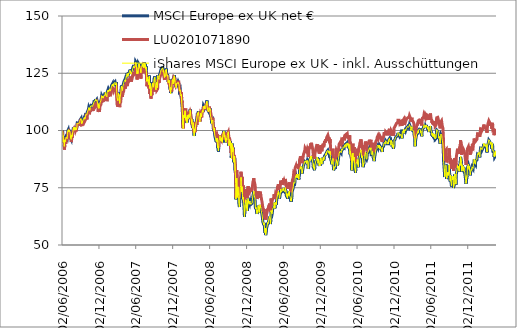
| Category | MSCI Europe ex UK net € | LU0201071890 | iShares MSCI Europe ex UK - inkl. Ausschüttungen |
|---|---|---|---|
| 02/06/2006 | 100 | 100 | 100 |
| 05/06/2006 | 99.412 | 100 | 99.411 |
| 06/06/2006 | 97.257 | 97.032 | 97.28 |
| 07/06/2006 | 97.73 | 96.475 | 97.733 |
| 08/06/2006 | 94.902 | 95.176 | 94.9 |
| 09/06/2006 | 96.413 | 95.176 | 96.423 |
| 12/06/2006 | 95.338 | 94.62 | 95.353 |
| 13/06/2006 | 93.068 | 92.208 | 93.094 |
| 14/06/2006 | 93.34 | 91.651 | 93.366 |
| 15/06/2006 | 95.714 | 93.692 | 95.713 |
| 16/06/2006 | 94.985 | 94.249 | 95.008 |
| 19/06/2006 | 95.79 | 94.991 | 95.854 |
| 20/06/2006 | 96.29 | 94.249 | 96.294 |
| 21/06/2006 | 96.523 | 94.62 | 96.536 |
| 22/06/2006 | 97.085 | 96.289 | 97.097 |
| 23/06/2006 | 97.28 | 95.918 | 97.291 |
| 26/06/2006 | 97.078 | 96.104 | 97.096 |
| 27/06/2006 | 96.367 | 96.289 | 96.387 |
| 28/06/2006 | 96.334 | 95.918 | 96.35 |
| 29/06/2006 | 98.132 | 96.846 | 98.143 |
| 30/06/2006 | 99.799 | 98.887 | 99.799 |
| 03/07/2006 | 100.395 | 99.258 | 100.377 |
| 04/07/2006 | 100.609 | 99.443 | 100.595 |
| 05/07/2006 | 99.355 | 98.887 | 99.334 |
| 06/07/2006 | 100.236 | 98.887 | 100.241 |
| 07/07/2006 | 99.886 | 99.258 | 99.877 |
| 10/07/2006 | 100.283 | 99.072 | 100.241 |
| 11/07/2006 | 99.255 | 98.887 | 99.233 |
| 12/07/2006 | 99.654 | 99.072 | 99.637 |
| 13/07/2006 | 98.024 | 97.217 | 98.008 |
| 14/07/2006 | 96.695 | 96.66 | 96.677 |
| 17/07/2006 | 96.121 | 94.991 | 96.103 |
| 18/07/2006 | 95.728 | 95.362 | 95.667 |
| 19/07/2006 | 98.02 | 95.547 | 97.97 |
| 20/07/2006 | 98.397 | 98.145 | 98.342 |
| 21/07/2006 | 97.405 | 96.846 | 97.369 |
| 24/07/2006 | 99.178 | 97.217 | 99.121 |
| 25/07/2006 | 99.263 | 98.701 | 99.24 |
| 26/07/2006 | 99.585 | 99.258 | 99.563 |
| 27/07/2006 | 100.687 | 100 | 100.642 |
| 28/07/2006 | 101.352 | 100.186 | 101.29 |
| 31/07/2006 | 101.094 | 100.742 | 101.013 |
| 01/08/2006 | 100.239 | 100.557 | 100.159 |
| 02/08/2006 | 101.308 | 100.371 | 101.215 |
| 03/08/2006 | 100.477 | 99.814 | 100.392 |
| 04/08/2006 | 101.553 | 101.113 | 101.468 |
| 07/08/2006 | 100.264 | 100 | 100.186 |
| 08/08/2006 | 100.424 | 99.814 | 100.317 |
| 09/08/2006 | 101.24 | 100.557 | 101.13 |
| 10/08/2006 | 100.366 | 99.629 | 100.269 |
| 11/08/2006 | 100.446 | 100.186 | 100.35 |
| 14/08/2006 | 101.387 | 100.557 | 101.287 |
| 15/08/2006 | 102.566 | 101.855 | 102.463 |
| 16/08/2006 | 103.279 | 102.597 | 103.19 |
| 17/08/2006 | 103.645 | 102.783 | 103.566 |
| 18/08/2006 | 103.442 | 102.968 | 103.353 |
| 21/08/2006 | 103.153 | 102.597 | 103.072 |
| 22/08/2006 | 103.535 | 102.226 | 103.453 |
| 23/08/2006 | 102.957 | 102.412 | 102.867 |
| 24/08/2006 | 103.38 | 102.968 | 103.298 |
| 25/08/2006 | 103.39 | 102.597 | 103.298 |
| 28/08/2006 | 103.922 | 102.597 | 103.297 |
| 29/08/2006 | 104.126 | 103.711 | 104.041 |
| 30/08/2006 | 104.593 | 103.896 | 104.517 |
| 31/08/2006 | 104.381 | 103.711 | 104.284 |
| 01/09/2006 | 104.733 | 104.267 | 104.643 |
| 04/09/2006 | 105.283 | 104.453 | 105.171 |
| 05/09/2006 | 104.923 | 103.896 | 104.816 |
| 06/09/2006 | 103.912 | 103.34 | 103.822 |
| 07/09/2006 | 103.056 | 102.412 | 102.955 |
| 08/09/2006 | 103.472 | 102.597 | 103.384 |
| 11/09/2006 | 103.033 | 102.226 | 102.915 |
| 12/09/2006 | 104.222 | 102.597 | 104.119 |
| 13/09/2006 | 104.64 | 103.525 | 104.535 |
| 14/09/2006 | 104.542 | 103.711 | 104.447 |
| 15/09/2006 | 104.926 | 103.896 | 104.834 |
| 18/09/2006 | 105.068 | 103.711 | 104.971 |
| 19/09/2006 | 104.507 | 103.896 | 104.419 |
| 20/09/2006 | 105.777 | 104.267 | 105.675 |
| 21/09/2006 | 106.015 | 104.824 | 105.942 |
| 22/09/2006 | 104.993 | 104.082 | 104.929 |
| 25/09/2006 | 104.894 | 104.267 | 104.815 |
| 26/09/2006 | 106.225 | 104.824 | 106.131 |
| 27/09/2006 | 107.01 | 105.195 | 106.918 |
| 28/09/2006 | 107.112 | 105.937 | 107.006 |
| 29/09/2006 | 107.163 | 106.122 | 107.059 |
| 02/10/2006 | 106.947 | 105.38 | 106.828 |
| 03/10/2006 | 106.574 | 104.824 | 106.445 |
| 04/10/2006 | 107.352 | 105.566 | 107.218 |
| 05/10/2006 | 108.148 | 106.679 | 108.032 |
| 06/10/2006 | 108.169 | 106.494 | 108.044 |
| 09/10/2006 | 108.348 | 106.679 | 108.228 |
| 10/10/2006 | 109.095 | 107.421 | 108.997 |
| 11/10/2006 | 109.251 | 107.236 | 109.147 |
| 12/10/2006 | 110.095 | 108.349 | 109.986 |
| 13/10/2006 | 110.059 | 108.534 | 109.948 |
| 16/10/2006 | 110.214 | 108.72 | 110.113 |
| 17/10/2006 | 108.931 | 107.978 | 108.824 |
| 18/10/2006 | 110.002 | 108.534 | 109.901 |
| 19/10/2006 | 110.02 | 108.349 | 109.937 |
| 20/10/2006 | 110.409 | 108.534 | 110.312 |
| 23/10/2006 | 110.924 | 108.72 | 110.817 |
| 24/10/2006 | 110.817 | 109.276 | 110.716 |
| 25/10/2006 | 111.1 | 109.462 | 111.006 |
| 26/10/2006 | 111.189 | 109.833 | 111.092 |
| 27/10/2006 | 110.99 | 109.276 | 110.897 |
| 30/10/2006 | 110.563 | 108.534 | 110.483 |
| 31/10/2006 | 110.517 | 109.091 | 110.433 |
| 01/11/2006 | 110.963 | 109.647 | 110.882 |
| 02/11/2006 | 110.289 | 108.534 | 110.19 |
| 03/11/2006 | 110.801 | 109.276 | 110.696 |
| 06/11/2006 | 112.119 | 109.833 | 112.031 |
| 07/11/2006 | 112.706 | 110.761 | 112.602 |
| 08/11/2006 | 112.616 | 110.39 | 112.515 |
| 09/11/2006 | 112.674 | 110.946 | 112.578 |
| 10/11/2006 | 112.563 | 110.761 | 112.462 |
| 13/11/2006 | 113.021 | 111.317 | 112.933 |
| 14/11/2006 | 112.923 | 111.503 | 112.818 |
| 15/11/2006 | 113.683 | 111.688 | 113.568 |
| 16/11/2006 | 113.759 | 112.059 | 113.65 |
| 17/11/2006 | 112.962 | 111.317 | 112.848 |
| 20/11/2006 | 113.299 | 111.132 | 113.181 |
| 21/11/2006 | 113.515 | 112.059 | 113.398 |
| 22/11/2006 | 113.755 | 112.245 | 113.644 |
| 23/11/2006 | 113.548 | 111.874 | 113.441 |
| 24/11/2006 | 112.593 | 110.39 | 112.484 |
| 27/11/2006 | 110.677 | 109.833 | 110.568 |
| 28/11/2006 | 110.186 | 108.163 | 110.072 |
| 29/11/2006 | 111.752 | 109.647 | 111.652 |
| 30/11/2006 | 110.847 | 109.833 | 110.747 |
| 01/12/2006 | 109.749 | 109.647 | 109.654 |
| 04/12/2006 | 110.593 | 108.163 | 110.495 |
| 05/12/2006 | 111.524 | 109.462 | 111.427 |
| 06/12/2006 | 111.613 | 109.833 | 111.521 |
| 07/12/2006 | 112.273 | 110.761 | 112.185 |
| 08/12/2006 | 112.217 | 110.575 | 112.124 |
| 11/12/2006 | 113.033 | 111.317 | 112.944 |
| 12/12/2006 | 113.438 | 111.503 | 113.354 |
| 13/12/2006 | 114.062 | 112.43 | 113.983 |
| 14/12/2006 | 114.692 | 112.616 | 114.603 |
| 15/12/2006 | 115.29 | 113.544 | 115.216 |
| 18/12/2006 | 115.383 | 113.915 | 115.297 |
| 19/12/2006 | 114.551 | 112.801 | 114.449 |
| 20/12/2006 | 115.07 | 113.173 | 114.975 |
| 21/12/2006 | 115.031 | 113.173 | 114.936 |
| 22/12/2006 | 114.214 | 112.987 | 114.121 |
| 25/12/2006 | 114.214 | 112.987 | 114.121 |
| 26/12/2006 | 114.199 | 112.987 | 114.121 |
| 27/12/2006 | 115.486 | 112.987 | 115.379 |
| 28/12/2006 | 115.485 | 113.544 | 115.388 |
| 29/12/2006 | 115.401 | 113.544 | 115.311 |
| 01/01/2007 | 115.401 | 113.544 | 115.313 |
| 02/01/2007 | 116.719 | 114.657 | 116.631 |
| 03/01/2007 | 116.91 | 114.842 | 116.811 |
| 04/01/2007 | 116.436 | 114.286 | 116.321 |
| 05/01/2007 | 115.622 | 114.286 | 115.503 |
| 08/01/2007 | 115.527 | 113.915 | 115.397 |
| 09/01/2007 | 115.679 | 114.1 | 115.543 |
| 10/01/2007 | 114.837 | 112.801 | 114.696 |
| 11/01/2007 | 116.733 | 113.358 | 116.591 |
| 12/01/2007 | 117.101 | 114.842 | 116.945 |
| 15/01/2007 | 117.789 | 115.584 | 117.616 |
| 16/01/2007 | 117.379 | 115.584 | 117.196 |
| 17/01/2007 | 117.133 | 114.657 | 116.934 |
| 18/01/2007 | 116.976 | 115.77 | 116.765 |
| 19/01/2007 | 117.873 | 115.028 | 117.681 |
| 22/01/2007 | 117.352 | 116.327 | 117.183 |
| 23/01/2007 | 117.285 | 115.028 | 117.111 |
| 24/01/2007 | 118.401 | 116.141 | 118.217 |
| 25/01/2007 | 118.156 | 116.512 | 117.955 |
| 26/01/2007 | 117.401 | 115.955 | 117.202 |
| 29/01/2007 | 117.931 | 115.77 | 117.728 |
| 30/01/2007 | 118.518 | 116.141 | 118.326 |
| 31/01/2007 | 118.255 | 116.327 | 118.082 |
| 01/02/2007 | 119.216 | 117.44 | 119.055 |
| 02/02/2007 | 119.683 | 117.625 | 119.498 |
| 05/02/2007 | 119.762 | 117.625 | 119.576 |
| 06/02/2007 | 119.937 | 118.182 | 119.743 |
| 07/02/2007 | 120.496 | 118.182 | 120.319 |
| 08/02/2007 | 119.616 | 117.254 | 119.433 |
| 09/02/2007 | 120.272 | 117.996 | 120.094 |
| 12/02/2007 | 119.393 | 117.254 | 119.209 |
| 13/02/2007 | 119.806 | 117.069 | 119.585 |
| 14/02/2007 | 120.821 | 117.625 | 120.613 |
| 15/02/2007 | 120.822 | 118.182 | 120.598 |
| 16/02/2007 | 120.744 | 118.182 | 120.518 |
| 19/02/2007 | 121.293 | 118.553 | 121.066 |
| 20/02/2007 | 120.81 | 117.996 | 120.556 |
| 21/02/2007 | 120.118 | 117.625 | 119.867 |
| 22/02/2007 | 120.438 | 118.182 | 120.185 |
| 23/02/2007 | 120.636 | 118.182 | 120.389 |
| 26/02/2007 | 121.134 | 118.738 | 120.873 |
| 27/02/2007 | 117.404 | 115.399 | 117.15 |
| 28/02/2007 | 115.781 | 113.544 | 115.537 |
| 01/03/2007 | 114.611 | 111.503 | 114.375 |
| 02/03/2007 | 114.491 | 111.503 | 114.267 |
| 05/03/2007 | 113.267 | 110.39 | 113.036 |
| 06/03/2007 | 114.131 | 111.503 | 113.901 |
| 07/03/2007 | 114.911 | 112.245 | 114.663 |
| 08/03/2007 | 116.483 | 113.544 | 116.248 |
| 09/03/2007 | 116.616 | 114.1 | 116.373 |
| 12/03/2007 | 116.246 | 113.358 | 116.003 |
| 13/03/2007 | 115.057 | 112.801 | 114.8 |
| 14/03/2007 | 112.085 | 110.204 | 111.842 |
| 15/03/2007 | 114.232 | 110.761 | 113.99 |
| 16/03/2007 | 114.311 | 111.688 | 114.064 |
| 19/03/2007 | 116.107 | 112.43 | 115.866 |
| 20/03/2007 | 116.747 | 112.616 | 116.511 |
| 21/03/2007 | 117.11 | 114.1 | 116.87 |
| 22/03/2007 | 119.094 | 115.77 | 118.85 |
| 23/03/2007 | 119.648 | 116.512 | 119.391 |
| 26/03/2007 | 118.558 | 116.698 | 118.296 |
| 27/03/2007 | 118.52 | 115.77 | 118.264 |
| 28/03/2007 | 117.76 | 114.657 | 117.506 |
| 29/03/2007 | 119.168 | 115.955 | 118.905 |
| 30/03/2007 | 119.238 | 116.327 | 118.928 |
| 02/04/2007 | 119.55 | 116.327 | 119.285 |
| 03/04/2007 | 120.906 | 117.254 | 120.632 |
| 04/04/2007 | 121.221 | 117.996 | 120.934 |
| 05/04/2007 | 121.533 | 118.553 | 121.254 |
| 06/04/2007 | 121.533 | 118.553 | 121.254 |
| 09/04/2007 | 121.449 | 118.553 | 121.254 |
| 10/04/2007 | 122.424 | 119.109 | 122.133 |
| 11/04/2007 | 122.124 | 120.037 | 121.832 |
| 12/04/2007 | 121.718 | 118.367 | 121.411 |
| 13/04/2007 | 122.542 | 119.481 | 122.214 |
| 16/04/2007 | 124.083 | 120.779 | 123.757 |
| 17/04/2007 | 124.02 | 121.336 | 123.711 |
| 18/04/2007 | 123.588 | 120.223 | 123.283 |
| 19/04/2007 | 123.261 | 119.481 | 122.952 |
| 20/04/2007 | 125.084 | 122.078 | 124.769 |
| 23/04/2007 | 124.992 | 121.892 | 124.681 |
| 24/04/2007 | 124.009 | 121.336 | 123.698 |
| 25/04/2007 | 124.997 | 122.078 | 124.687 |
| 26/04/2007 | 125.467 | 122.635 | 125.161 |
| 27/04/2007 | 124.792 | 121.336 | 124.486 |
| 30/04/2007 | 124.998 | 121.707 | 124.691 |
| 01/05/2007 | 124.966 | 121.707 | 124.665 |
| 02/05/2007 | 125.621 | 121.892 | 125.294 |
| 03/05/2007 | 125.657 | 122.449 | 125.339 |
| 04/05/2007 | 126.602 | 123.006 | 126.258 |
| 07/05/2007 | 126.765 | 123.562 | 126.437 |
| 08/05/2007 | 125.49 | 122.449 | 125.147 |
| 09/05/2007 | 125.782 | 122.263 | 125.451 |
| 10/05/2007 | 124.941 | 122.449 | 124.599 |
| 11/05/2007 | 125.655 | 121.336 | 125.305 |
| 14/05/2007 | 125.523 | 122.82 | 125.192 |
| 15/05/2007 | 126.16 | 122.635 | 125.806 |
| 16/05/2007 | 125.865 | 123.377 | 125.557 |
| 17/05/2007 | 126.093 | 123.377 | 125.789 |
| 18/05/2007 | 127.381 | 124.49 | 127.049 |
| 21/05/2007 | 127.408 | 125.046 | 127.017 |
| 22/05/2007 | 127.552 | 125.046 | 127.212 |
| 23/05/2007 | 128.558 | 125.603 | 128.207 |
| 24/05/2007 | 127.606 | 125.232 | 127.274 |
| 25/05/2007 | 127.726 | 124.675 | 127.374 |
| 28/05/2007 | 128.003 | 124.675 | 127.639 |
| 29/05/2007 | 128.034 | 125.232 | 127.68 |
| 30/05/2007 | 127.735 | 124.119 | 127.389 |
| 31/05/2007 | 129.046 | 126.531 | 128.683 |
| 01/06/2007 | 130.112 | 127.458 | 129.753 |
| 04/06/2007 | 129.657 | 127.087 | 129.288 |
| 05/06/2007 | 128.93 | 126.716 | 128.57 |
| 06/06/2007 | 126.83 | 125.603 | 126.469 |
| 07/06/2007 | 125.129 | 123.191 | 124.791 |
| 08/06/2007 | 124.947 | 122.263 | 124.612 |
| 11/06/2007 | 126.07 | 123.562 | 125.733 |
| 12/06/2007 | 125.159 | 123.191 | 124.842 |
| 13/06/2007 | 125.454 | 123.191 | 125.121 |
| 14/06/2007 | 127.646 | 124.861 | 127.306 |
| 15/06/2007 | 129.291 | 127.458 | 128.933 |
| 18/06/2007 | 128.954 | 127.644 | 128.622 |
| 19/06/2007 | 128.649 | 126.716 | 128.317 |
| 20/06/2007 | 129.259 | 128.2 | 128.926 |
| 21/06/2007 | 127.754 | 125.974 | 127.436 |
| 22/06/2007 | 127.407 | 125.603 | 127.088 |
| 25/06/2007 | 127.088 | 124.304 | 126.769 |
| 26/06/2007 | 126.125 | 124.304 | 125.821 |
| 27/06/2007 | 125.505 | 122.635 | 125.204 |
| 28/06/2007 | 126.955 | 124.304 | 126.642 |
| 29/06/2007 | 127.724 | 124.861 | 127.393 |
| 02/07/2007 | 127.541 | 125.417 | 127.222 |
| 03/07/2007 | 128.586 | 126.716 | 128.259 |
| 04/07/2007 | 129.195 | 127.087 | 128.857 |
| 05/07/2007 | 128.394 | 126.902 | 128.057 |
| 06/07/2007 | 129.12 | 126.902 | 128.763 |
| 09/07/2007 | 129.511 | 127.644 | 129.15 |
| 10/07/2007 | 128.264 | 126.345 | 127.92 |
| 11/07/2007 | 127.716 | 125.046 | 127.381 |
| 12/07/2007 | 129.323 | 126.345 | 128.979 |
| 13/07/2007 | 129.805 | 128.015 | 129.461 |
| 16/07/2007 | 130.144 | 128.015 | 129.793 |
| 17/07/2007 | 129.401 | 127.458 | 129.05 |
| 18/07/2007 | 127.886 | 126.531 | 127.536 |
| 19/07/2007 | 129.155 | 127.273 | 128.813 |
| 20/07/2007 | 127.412 | 126.16 | 127.079 |
| 23/07/2007 | 128.085 | 125.232 | 127.765 |
| 24/07/2007 | 126.29 | 124.49 | 125.987 |
| 25/07/2007 | 124.925 | 123.748 | 124.645 |
| 26/07/2007 | 121.732 | 120.408 | 121.482 |
| 27/07/2007 | 121.357 | 119.295 | 121.113 |
| 30/07/2007 | 121.394 | 119.481 | 121.155 |
| 31/07/2007 | 123.567 | 121.15 | 123.297 |
| 01/08/2007 | 121.831 | 120.408 | 121.563 |
| 02/08/2007 | 122.57 | 120.779 | 122.288 |
| 03/08/2007 | 121.127 | 119.852 | 120.849 |
| 06/08/2007 | 120.203 | 118.367 | 119.94 |
| 07/08/2007 | 121.614 | 118.553 | 121.354 |
| 08/08/2007 | 124.039 | 120.408 | 123.761 |
| 09/08/2007 | 121.77 | 118.553 | 121.526 |
| 10/08/2007 | 118.569 | 115.955 | 118.354 |
| 13/08/2007 | 120.793 | 117.996 | 120.541 |
| 14/08/2007 | 119.489 | 118.182 | 119.236 |
| 15/08/2007 | 119.221 | 115.955 | 118.963 |
| 16/08/2007 | 115.395 | 113.915 | 115.167 |
| 17/08/2007 | 117.532 | 115.399 | 117.285 |
| 20/08/2007 | 118.37 | 115.955 | 118.111 |
| 21/08/2007 | 118.477 | 115.399 | 118.22 |
| 22/08/2007 | 120.286 | 117.44 | 119.987 |
| 23/08/2007 | 120.413 | 118.367 | 120.115 |
| 24/08/2007 | 120.99 | 117.996 | 120.684 |
| 27/08/2007 | 121.152 | 119.109 | 120.839 |
| 28/08/2007 | 119.218 | 117.811 | 118.934 |
| 29/08/2007 | 119.87 | 117.069 | 119.575 |
| 30/08/2007 | 121.102 | 117.625 | 120.795 |
| 31/08/2007 | 122.547 | 120.223 | 122.235 |
| 03/09/2007 | 122.812 | 120.408 | 122.498 |
| 04/09/2007 | 123.598 | 120.408 | 123.293 |
| 05/09/2007 | 121.345 | 120.037 | 121.038 |
| 06/09/2007 | 121.687 | 119.295 | 121.371 |
| 07/09/2007 | 119.093 | 117.811 | 118.761 |
| 10/09/2007 | 118.087 | 117.069 | 117.759 |
| 11/09/2007 | 119.852 | 116.883 | 119.536 |
| 12/09/2007 | 120.215 | 117.069 | 119.908 |
| 13/09/2007 | 121.314 | 118.738 | 120.993 |
| 14/09/2007 | 120.325 | 117.625 | 120.016 |
| 17/09/2007 | 119.018 | 117.254 | 118.73 |
| 18/09/2007 | 120.855 | 118.182 | 120.555 |
| 19/09/2007 | 124.249 | 121.892 | 123.954 |
| 20/09/2007 | 123.485 | 121.521 | 123.183 |
| 21/09/2007 | 123.91 | 122.078 | 123.619 |
| 24/09/2007 | 123.685 | 122.078 | 123.376 |
| 25/09/2007 | 122.609 | 120.779 | 122.296 |
| 26/09/2007 | 123.513 | 121.892 | 123.2 |
| 27/09/2007 | 124.252 | 122.449 | 123.945 |
| 28/09/2007 | 124.246 | 122.449 | 123.927 |
| 01/10/2007 | 125.249 | 122.263 | 124.915 |
| 02/10/2007 | 125.742 | 124.119 | 125.386 |
| 03/10/2007 | 125.852 | 123.748 | 125.482 |
| 04/10/2007 | 125.786 | 123.933 | 125.451 |
| 05/10/2007 | 126.778 | 124.675 | 126.44 |
| 08/10/2007 | 126.529 | 124.675 | 126.166 |
| 09/10/2007 | 127.07 | 125.046 | 126.699 |
| 10/10/2007 | 127.134 | 125.417 | 126.802 |
| 11/10/2007 | 127.954 | 126.531 | 127.598 |
| 12/10/2007 | 127.874 | 125.788 | 127.543 |
| 15/10/2007 | 126.918 | 126.345 | 126.59 |
| 16/10/2007 | 125.856 | 124.304 | 125.523 |
| 17/10/2007 | 126.472 | 125.232 | 126.138 |
| 18/10/2007 | 125.703 | 124.119 | 125.372 |
| 19/10/2007 | 125.12 | 124.49 | 124.806 |
| 22/10/2007 | 123.446 | 122.078 | 123.138 |
| 23/10/2007 | 124.546 | 123.748 | 124.252 |
| 24/10/2007 | 123.81 | 123.377 | 123.522 |
| 25/10/2007 | 125.274 | 123.748 | 124.98 |
| 26/10/2007 | 125.926 | 124.49 | 125.634 |
| 29/10/2007 | 126.661 | 125.232 | 126.378 |
| 30/10/2007 | 126.093 | 124.675 | 125.815 |
| 31/10/2007 | 127.03 | 125.046 | 126.74 |
| 01/11/2007 | 125.158 | 123.562 | 124.86 |
| 02/11/2007 | 124.549 | 123.191 | 124.257 |
| 05/11/2007 | 123.931 | 123.006 | 123.655 |
| 06/11/2007 | 124.573 | 123.933 | 124.292 |
| 07/11/2007 | 124.03 | 123.377 | 123.734 |
| 08/11/2007 | 123.11 | 122.82 | 122.819 |
| 09/11/2007 | 121.234 | 121.707 | 120.932 |
| 12/11/2007 | 121.373 | 120.594 | 121.054 |
| 13/11/2007 | 121.415 | 120.223 | 121.059 |
| 14/11/2007 | 122.277 | 121.892 | 121.927 |
| 15/11/2007 | 121.012 | 120.037 | 120.672 |
| 16/11/2007 | 120.217 | 120.223 | 119.88 |
| 19/11/2007 | 117.902 | 118.924 | 117.569 |
| 20/11/2007 | 119.075 | 118.182 | 118.76 |
| 21/11/2007 | 116.386 | 117.069 | 116.073 |
| 22/11/2007 | 116.875 | 116.883 | 116.575 |
| 23/11/2007 | 118.628 | 118.182 | 118.318 |
| 26/11/2007 | 118.183 | 118.553 | 117.88 |
| 27/11/2007 | 117.784 | 117.069 | 117.476 |
| 28/11/2007 | 120.562 | 119.109 | 120.249 |
| 29/11/2007 | 121.227 | 120.594 | 120.905 |
| 30/11/2007 | 122.545 | 122.078 | 122.237 |
| 03/12/2007 | 121.858 | 121.707 | 121.55 |
| 04/12/2007 | 120.614 | 120.037 | 120.314 |
| 05/12/2007 | 122.599 | 122.078 | 122.291 |
| 06/12/2007 | 122.711 | 122.078 | 122.403 |
| 07/12/2007 | 123.525 | 123.191 | 123.217 |
| 10/12/2007 | 124.218 | 123.191 | 123.896 |
| 11/12/2007 | 123.867 | 123.377 | 123.543 |
| 12/12/2007 | 124.066 | 122.635 | 123.743 |
| 13/12/2007 | 121.321 | 121.336 | 121.011 |
| 14/12/2007 | 121.693 | 120.223 | 121.377 |
| 17/12/2007 | 119.575 | 119.481 | 119.277 |
| 18/12/2007 | 119.339 | 119.852 | 119.042 |
| 19/12/2007 | 118.873 | 119.109 | 118.583 |
| 20/12/2007 | 119.158 | 119.481 | 118.867 |
| 21/12/2007 | 120.827 | 120.408 | 120.533 |
| 24/12/2007 | 120.907 | 120.594 | 120.608 |
| 25/12/2007 | 120.907 | 120.594 | 120.608 |
| 26/12/2007 | 120.929 | 120.594 | 120.608 |
| 27/12/2007 | 121.218 | 121.15 | 120.919 |
| 28/12/2007 | 121.409 | 121.15 | 121.105 |
| 31/12/2007 | 121.421 | 121.15 | 121.115 |
| 01/01/2008 | 121.421 | 121.15 | 121.115 |
| 02/01/2008 | 120.28 | 121.336 | 119.965 |
| 03/01/2008 | 119.587 | 119.295 | 119.281 |
| 04/01/2008 | 117.482 | 117.996 | 117.181 |
| 07/01/2008 | 117.196 | 117.625 | 116.898 |
| 08/01/2008 | 118.075 | 118.367 | 117.776 |
| 09/01/2008 | 116.818 | 116.883 | 116.536 |
| 10/01/2008 | 115.875 | 116.512 | 115.608 |
| 11/01/2008 | 115.29 | 115.955 | 115.037 |
| 14/01/2008 | 115.959 | 116.698 | 115.704 |
| 15/01/2008 | 112.822 | 114.286 | 112.597 |
| 16/01/2008 | 111.538 | 112.245 | 111.315 |
| 17/01/2008 | 110.731 | 112.801 | 110.508 |
| 18/01/2008 | 109.358 | 112.245 | 109.155 |
| 21/01/2008 | 102.729 | 105.38 | 102.544 |
| 22/01/2008 | 104.593 | 102.226 | 104.42 |
| 23/01/2008 | 101.073 | 100.928 | 100.92 |
| 24/01/2008 | 106.68 | 106.308 | 106.526 |
| 25/01/2008 | 106.562 | 108.72 | 106.403 |
| 28/01/2008 | 105.729 | 105.38 | 105.578 |
| 29/01/2008 | 107.415 | 107.607 | 107.251 |
| 30/01/2008 | 106.785 | 107.236 | 106.622 |
| 31/01/2008 | 106.549 | 105.009 | 106.381 |
| 01/02/2008 | 108.78 | 108.905 | 108.618 |
| 04/02/2008 | 108.9 | 109.647 | 108.726 |
| 05/02/2008 | 104.992 | 106.865 | 104.824 |
| 06/02/2008 | 105.925 | 106.122 | 105.751 |
| 07/02/2008 | 104.116 | 104.082 | 103.947 |
| 08/02/2008 | 104.193 | 104.453 | 104.029 |
| 11/02/2008 | 103.402 | 105.009 | 103.241 |
| 12/02/2008 | 106.761 | 106.122 | 106.579 |
| 13/02/2008 | 106.97 | 107.236 | 106.784 |
| 14/02/2008 | 107.064 | 108.163 | 106.877 |
| 15/02/2008 | 105.215 | 105.937 | 105.041 |
| 18/02/2008 | 107.048 | 107.05 | 106.863 |
| 19/02/2008 | 107.462 | 107.978 | 107.271 |
| 20/02/2008 | 106.179 | 105.937 | 105.987 |
| 21/02/2008 | 106.865 | 107.792 | 106.654 |
| 22/02/2008 | 105.948 | 107.236 | 105.73 |
| 25/02/2008 | 107.636 | 107.236 | 107.417 |
| 26/02/2008 | 109.221 | 108.349 | 108.998 |
| 27/02/2008 | 109.318 | 107.978 | 109.101 |
| 28/02/2008 | 107.569 | 107.792 | 107.354 |
| 29/02/2008 | 106.175 | 106.679 | 106.012 |
| 03/03/2008 | 104.767 | 104.824 | 104.621 |
| 04/03/2008 | 103.124 | 104.082 | 102.981 |
| 05/03/2008 | 105.019 | 104.453 | 104.867 |
| 06/03/2008 | 103.517 | 104.082 | 103.38 |
| 07/03/2008 | 102.284 | 102.412 | 102.145 |
| 10/03/2008 | 101.068 | 102.412 | 100.933 |
| 11/03/2008 | 102.431 | 103.525 | 102.3 |
| 12/03/2008 | 103.563 | 103.711 | 103.438 |
| 13/03/2008 | 102.368 | 101.299 | 102.245 |
| 14/03/2008 | 101.504 | 102.226 | 101.384 |
| 17/03/2008 | 97.666 | 99.072 | 97.556 |
| 18/03/2008 | 100.747 | 100.742 | 100.641 |
| 19/03/2008 | 100.126 | 100.928 | 100.027 |
| 20/03/2008 | 99.565 | 99.258 | 99.462 |
| 21/03/2008 | 99.565 | 99.258 | 99.462 |
| 24/03/2008 | 99.41 | 99.258 | 99.462 |
| 25/03/2008 | 102.804 | 102.041 | 102.691 |
| 26/03/2008 | 102.512 | 102.226 | 102.393 |
| 27/03/2008 | 103.738 | 103.711 | 103.596 |
| 28/03/2008 | 103.48 | 103.154 | 103.339 |
| 31/03/2008 | 103.35 | 102.412 | 103.192 |
| 01/04/2008 | 106.492 | 104.638 | 106.309 |
| 02/04/2008 | 107.652 | 106.865 | 107.444 |
| 03/04/2008 | 106.903 | 105.937 | 106.696 |
| 04/04/2008 | 107.45 | 106.865 | 107.239 |
| 07/04/2008 | 108.397 | 107.792 | 108.181 |
| 08/04/2008 | 107.611 | 106.679 | 107.393 |
| 09/04/2008 | 106.692 | 106.679 | 106.473 |
| 10/04/2008 | 106.245 | 105.195 | 106.033 |
| 11/04/2008 | 104.882 | 104.824 | 104.676 |
| 14/04/2008 | 103.988 | 103.896 | 103.791 |
| 15/04/2008 | 104.492 | 104.824 | 104.285 |
| 16/04/2008 | 106.213 | 105.38 | 106.003 |
| 17/04/2008 | 105.432 | 105.009 | 105.233 |
| 18/04/2008 | 107.674 | 107.236 | 107.456 |
| 21/04/2008 | 106.932 | 106.679 | 106.703 |
| 22/04/2008 | 106.261 | 106.679 | 106.039 |
| 23/04/2008 | 106.957 | 105.751 | 106.728 |
| 24/04/2008 | 107.079 | 106.679 | 106.848 |
| 25/04/2008 | 108.289 | 108.534 | 108.048 |
| 28/04/2008 | 109.042 | 108.905 | 108.782 |
| 29/04/2008 | 108.228 | 108.349 | 107.974 |
| 30/04/2008 | 109.036 | 108.534 | 108.778 |
| 01/05/2008 | 109.043 | 108.534 | 108.785 |
| 02/05/2008 | 110.743 | 110.575 | 110.494 |
| 05/05/2008 | 110.676 | 110.204 | 110.425 |
| 06/05/2008 | 109.967 | 109.462 | 109.73 |
| 07/05/2008 | 111.046 | 110.575 | 110.784 |
| 08/05/2008 | 110.816 | 110.204 | 110.553 |
| 09/05/2008 | 109.67 | 109.276 | 109.421 |
| 12/05/2008 | 109.945 | 109.276 | 109.701 |
| 13/05/2008 | 110.217 | 110.204 | 109.964 |
| 14/05/2008 | 111.074 | 110.575 | 110.811 |
| 15/05/2008 | 111.373 | 110.761 | 111.102 |
| 16/05/2008 | 111.921 | 112.059 | 111.647 |
| 19/05/2008 | 113.128 | 112.245 | 112.822 |
| 20/05/2008 | 111.231 | 111.132 | 110.923 |
| 21/05/2008 | 110.483 | 110.761 | 110.212 |
| 22/05/2008 | 110.705 | 110.019 | 110.43 |
| 23/05/2008 | 108.965 | 110.204 | 108.718 |
| 26/05/2008 | 108.635 | 109.091 | 108.39 |
| 27/05/2008 | 108.339 | 108.349 | 108.092 |
| 28/05/2008 | 109.277 | 109.647 | 109.034 |
| 29/05/2008 | 109.549 | 109.462 | 109.295 |
| 30/05/2008 | 110.24 | 110.39 | 109.979 |
| 02/06/2008 | 109.089 | 109.462 | 108.87 |
| 03/06/2008 | 109.692 | 109.647 | 109.468 |
| 04/06/2008 | 108.642 | 108.163 | 108.423 |
| 05/06/2008 | 108.488 | 108.72 | 108.301 |
| 06/06/2008 | 106.367 | 108.163 | 106.204 |
| 09/06/2008 | 105.738 | 106.679 | 105.594 |
| 10/06/2008 | 104.916 | 105.566 | 104.778 |
| 11/06/2008 | 103.143 | 105.566 | 103.03 |
| 12/06/2008 | 103.937 | 104.824 | 103.816 |
| 13/06/2008 | 104.364 | 104.453 | 104.238 |
| 16/06/2008 | 103.991 | 104.267 | 103.904 |
| 17/06/2008 | 104.555 | 105.566 | 104.612 |
| 18/06/2008 | 103.064 | 104.082 | 103.134 |
| 19/06/2008 | 102.355 | 103.525 | 102.443 |
| 20/06/2008 | 100.78 | 101.855 | 100.888 |
| 23/06/2008 | 100.321 | 101.67 | 100.449 |
| 24/06/2008 | 99.551 | 100.371 | 99.692 |
| 25/06/2008 | 100.97 | 101.299 | 101.098 |
| 26/06/2008 | 98.472 | 100.371 | 98.633 |
| 27/06/2008 | 97.739 | 99.629 | 97.911 |
| 30/06/2008 | 98.079 | 99.629 | 98.261 |
| 01/07/2008 | 96.141 | 98.145 | 96.346 |
| 02/07/2008 | 95.775 | 98.516 | 95.992 |
| 03/07/2008 | 96.337 | 98.145 | 96.549 |
| 04/07/2008 | 95.069 | 97.588 | 95.296 |
| 07/07/2008 | 96.309 | 98.145 | 96.524 |
| 08/07/2008 | 94.823 | 97.588 | 95.052 |
| 09/07/2008 | 96.486 | 98.33 | 96.692 |
| 10/07/2008 | 94.699 | 97.217 | 94.924 |
| 11/07/2008 | 92.253 | 95.176 | 92.508 |
| 14/07/2008 | 92.814 | 95.547 | 93.062 |
| 15/07/2008 | 90.831 | 93.135 | 91.095 |
| 16/07/2008 | 91.642 | 92.579 | 91.9 |
| 17/07/2008 | 94.2 | 95.547 | 94.29 |
| 18/07/2008 | 95.708 | 95.918 | 95.778 |
| 21/07/2008 | 96.334 | 97.217 | 96.395 |
| 22/07/2008 | 95.95 | 95.547 | 96.006 |
| 23/07/2008 | 97.64 | 97.774 | 97.684 |
| 24/07/2008 | 96.365 | 97.032 | 96.424 |
| 25/07/2008 | 96.174 | 96.289 | 96.242 |
| 28/07/2008 | 95.218 | 96.66 | 95.295 |
| 29/07/2008 | 95.451 | 95.733 | 95.532 |
| 30/07/2008 | 96.733 | 97.588 | 96.796 |
| 31/07/2008 | 96.765 | 97.403 | 96.816 |
| 01/08/2008 | 95.497 | 97.217 | 95.558 |
| 04/08/2008 | 94.762 | 96.104 | 94.839 |
| 05/08/2008 | 97.116 | 96.846 | 97.149 |
| 06/08/2008 | 98.096 | 97.588 | 98.137 |
| 07/08/2008 | 97.787 | 98.516 | 97.828 |
| 08/08/2008 | 98.457 | 97.774 | 98.489 |
| 11/08/2008 | 99.737 | 99.258 | 99.755 |
| 12/08/2008 | 99.385 | 99.443 | 99.419 |
| 13/08/2008 | 97.225 | 98.145 | 97.275 |
| 14/08/2008 | 97.471 | 97.032 | 97.517 |
| 15/08/2008 | 98.033 | 97.959 | 98.054 |
| 18/08/2008 | 97.968 | 98.701 | 97.986 |
| 19/08/2008 | 95.568 | 96.475 | 95.612 |
| 20/08/2008 | 95.847 | 96.289 | 95.885 |
| 21/08/2008 | 94.766 | 95.733 | 94.834 |
| 22/08/2008 | 96.543 | 96.66 | 96.576 |
| 25/08/2008 | 95.771 | 96.66 | 95.817 |
| 26/08/2008 | 96.247 | 96.104 | 96.289 |
| 27/08/2008 | 96.277 | 96.475 | 96.289 |
| 28/08/2008 | 97.851 | 97.959 | 97.874 |
| 29/08/2008 | 98.175 | 98.701 | 98.193 |
| 01/09/2008 | 98.105 | 98.516 | 98.131 |
| 02/09/2008 | 99.398 | 99.443 | 99.428 |
| 03/09/2008 | 98.206 | 98.701 | 98.24 |
| 04/09/2008 | 95.488 | 97.774 | 95.513 |
| 05/09/2008 | 93.293 | 94.249 | 93.309 |
| 08/09/2008 | 95.993 | 96.846 | 96.013 |
| 09/09/2008 | 95.184 | 95.918 | 95.203 |
| 10/09/2008 | 94.52 | 94.62 | 94.534 |
| 11/09/2008 | 93.832 | 93.321 | 93.848 |
| 12/09/2008 | 95.33 | 94.249 | 95.346 |
| 15/09/2008 | 92.065 | 92.022 | 92.085 |
| 16/09/2008 | 90.186 | 90.167 | 90.218 |
| 17/09/2008 | 88.14 | 90.724 | 88.178 |
| 18/09/2008 | 87.705 | 89.239 | 87.74 |
| 19/09/2008 | 94.445 | 93.506 | 94.469 |
| 22/09/2008 | 92.704 | 93.878 | 92.739 |
| 23/09/2008 | 91.139 | 91.466 | 91.172 |
| 24/09/2008 | 90.547 | 91.466 | 90.591 |
| 25/09/2008 | 92.527 | 92.022 | 92.573 |
| 26/09/2008 | 90.801 | 90.724 | 90.846 |
| 29/09/2008 | 86.116 | 89.239 | 86.164 |
| 30/09/2008 | 87.265 | 87.199 | 87.315 |
| 01/10/2008 | 87.777 | 89.054 | 87.819 |
| 02/10/2008 | 86.375 | 89.239 | 86.413 |
| 03/10/2008 | 88.756 | 87.755 | 88.795 |
| 06/10/2008 | 82.097 | 85.9 | 82.137 |
| 07/10/2008 | 81.456 | 83.859 | 81.488 |
| 08/10/2008 | 76.795 | 80.891 | 76.85 |
| 09/10/2008 | 75.102 | 79.777 | 75.162 |
| 10/10/2008 | 69.914 | 70.686 | 69.976 |
| 13/10/2008 | 76.962 | 75.51 | 77.033 |
| 14/10/2008 | 79.208 | 82.746 | 79.245 |
| 15/10/2008 | 74.331 | 78.108 | 74.365 |
| 16/10/2008 | 70.781 | 75.325 | 70.81 |
| 17/10/2008 | 73.303 | 74.212 | 73.34 |
| 20/10/2008 | 75.381 | 77.737 | 75.412 |
| 21/10/2008 | 75.214 | 78.293 | 75.233 |
| 22/10/2008 | 71.589 | 76.067 | 71.637 |
| 23/10/2008 | 71.115 | 74.212 | 71.156 |
| 24/10/2008 | 68.196 | 70.686 | 68.235 |
| 27/10/2008 | 66.576 | 70.872 | 66.605 |
| 28/10/2008 | 68.126 | 72.356 | 68.137 |
| 29/10/2008 | 72.287 | 75.51 | 72.29 |
| 30/10/2008 | 73.084 | 77.737 | 73.095 |
| 31/10/2008 | 75.099 | 77.365 | 75.07 |
| 03/11/2008 | 76.011 | 79.592 | 75.998 |
| 04/11/2008 | 79.567 | 82.004 | 79.541 |
| 05/11/2008 | 77.744 | 81.633 | 77.726 |
| 06/11/2008 | 73.282 | 78.479 | 73.265 |
| 07/11/2008 | 74.722 | 76.252 | 74.705 |
| 10/11/2008 | 75.481 | 79.777 | 75.46 |
| 11/11/2008 | 72.199 | 76.809 | 72.186 |
| 12/11/2008 | 70.03 | 75.139 | 70.017 |
| 13/11/2008 | 70.243 | 73.84 | 70.235 |
| 14/11/2008 | 70.871 | 76.067 | 70.875 |
| 17/11/2008 | 68.568 | 73.284 | 68.568 |
| 18/11/2008 | 68.819 | 72.542 | 68.817 |
| 19/11/2008 | 66.098 | 71.614 | 66.092 |
| 20/11/2008 | 63.901 | 68.646 | 63.905 |
| 21/11/2008 | 62.255 | 68.275 | 62.256 |
| 24/11/2008 | 67.43 | 69.388 | 67.423 |
| 25/11/2008 | 67.829 | 74.397 | 67.838 |
| 26/11/2008 | 67.552 | 71.614 | 67.556 |
| 27/11/2008 | 69.261 | 74.212 | 69.267 |
| 28/11/2008 | 69.754 | 74.397 | 69.754 |
| 01/12/2008 | 66.096 | 71.8 | 66.115 |
| 02/12/2008 | 67.451 | 72.913 | 67.452 |
| 03/12/2008 | 67.81 | 73.284 | 67.823 |
| 04/12/2008 | 67.818 | 73.469 | 67.833 |
| 05/12/2008 | 64.86 | 70.501 | 64.877 |
| 08/12/2008 | 69.463 | 74.954 | 69.479 |
| 09/12/2008 | 70.264 | 75.696 | 70.277 |
| 10/12/2008 | 70.507 | 76.067 | 70.512 |
| 11/12/2008 | 69.975 | 75.51 | 69.99 |
| 12/12/2008 | 68.329 | 73.84 | 68.339 |
| 15/12/2008 | 67.783 | 73.284 | 67.798 |
| 16/12/2008 | 68.648 | 74.212 | 68.677 |
| 17/12/2008 | 68.807 | 74.212 | 68.842 |
| 18/12/2008 | 69.132 | 74.768 | 69.185 |
| 19/12/2008 | 68.646 | 74.212 | 68.688 |
| 22/12/2008 | 67.68 | 73.655 | 67.737 |
| 23/12/2008 | 67.589 | 73.655 | 67.652 |
| 24/12/2008 | 67.506 | 73.469 | 67.565 |
| 25/12/2008 | 67.506 | 73.469 | 67.565 |
| 26/12/2008 | 67.489 | 73.469 | 67.565 |
| 29/12/2008 | 68.201 | 74.212 | 68.254 |
| 30/12/2008 | 69.492 | 75.325 | 69.55 |
| 31/12/2008 | 69.546 | 75.51 | 69.607 |
| 01/01/2009 | 69.546 | 75.51 | 69.607 |
| 02/01/2009 | 71.611 | 77.551 | 71.666 |
| 05/01/2009 | 72.731 | 78.479 | 72.784 |
| 06/01/2009 | 73.526 | 79.221 | 73.569 |
| 07/01/2009 | 72.73 | 78.108 | 72.764 |
| 08/01/2009 | 72.123 | 77.737 | 72.164 |
| 09/01/2009 | 71.426 | 77.551 | 71.475 |
| 12/01/2009 | 70.367 | 76.438 | 70.422 |
| 13/01/2009 | 69.359 | 75.696 | 69.424 |
| 14/01/2009 | 66.494 | 73.284 | 66.561 |
| 15/01/2009 | 65.849 | 72.356 | 65.92 |
| 16/01/2009 | 66.455 | 72.913 | 66.518 |
| 19/01/2009 | 65.531 | 72.356 | 65.583 |
| 20/01/2009 | 64.306 | 71.243 | 64.355 |
| 21/01/2009 | 64.285 | 70.872 | 64.344 |
| 22/01/2009 | 63.609 | 70.13 | 63.668 |
| 23/01/2009 | 63.299 | 69.944 | 63.361 |
| 26/01/2009 | 65.229 | 71.8 | 65.287 |
| 27/01/2009 | 65.071 | 71.614 | 65.123 |
| 28/01/2009 | 67.184 | 73.469 | 67.244 |
| 29/01/2009 | 65.857 | 71.985 | 65.914 |
| 30/01/2009 | 65.512 | 71.8 | 65.569 |
| 02/02/2009 | 64.129 | 70.501 | 64.197 |
| 03/02/2009 | 65.235 | 71.614 | 65.288 |
| 04/02/2009 | 66.559 | 72.727 | 66.612 |
| 05/02/2009 | 66.128 | 72.171 | 66.173 |
| 06/02/2009 | 67.503 | 73.284 | 67.551 |
| 09/02/2009 | 67.92 | 73.469 | 67.964 |
| 10/02/2009 | 66.239 | 71.8 | 66.287 |
| 11/02/2009 | 66.172 | 71.8 | 66.21 |
| 12/02/2009 | 65.088 | 70.686 | 65.127 |
| 13/02/2009 | 65.467 | 71.058 | 65.507 |
| 16/02/2009 | 64.691 | 70.315 | 64.734 |
| 17/02/2009 | 62.562 | 68.275 | 62.613 |
| 18/02/2009 | 62.478 | 68.46 | 62.526 |
| 19/02/2009 | 62.559 | 68.46 | 62.607 |
| 20/02/2009 | 60.085 | 66.234 | 60.145 |
| 23/02/2009 | 59.316 | 65.677 | 59.373 |
| 24/02/2009 | 58.654 | 65.121 | 58.725 |
| 25/02/2009 | 58.362 | 64.564 | 58.43 |
| 26/02/2009 | 59.633 | 65.677 | 59.708 |
| 27/02/2009 | 58.78 | 65.121 | 58.86 |
| 02/03/2009 | 56.137 | 62.338 | 56.214 |
| 03/03/2009 | 55.28 | 61.596 | 55.352 |
| 04/03/2009 | 57.322 | 63.636 | 57.399 |
| 05/03/2009 | 55.113 | 61.596 | 55.185 |
| 06/03/2009 | 54.307 | 61.039 | 54.381 |
| 09/03/2009 | 54.165 | 60.853 | 54.243 |
| 10/03/2009 | 57.061 | 63.451 | 57.142 |
| 11/03/2009 | 57.531 | 63.636 | 57.617 |
| 12/03/2009 | 57.935 | 63.822 | 58.03 |
| 13/03/2009 | 58.117 | 64.193 | 58.209 |
| 16/03/2009 | 59.675 | 65.863 | 59.756 |
| 17/03/2009 | 59.231 | 65.306 | 59.313 |
| 18/03/2009 | 59.278 | 65.306 | 59.362 |
| 19/03/2009 | 59.792 | 65.306 | 59.883 |
| 20/03/2009 | 59.916 | 65.492 | 60.002 |
| 23/03/2009 | 61.641 | 67.347 | 61.723 |
| 24/03/2009 | 61.627 | 67.532 | 61.707 |
| 25/03/2009 | 62.378 | 68.089 | 62.457 |
| 26/03/2009 | 62.584 | 68.089 | 62.674 |
| 27/03/2009 | 61.624 | 66.976 | 61.717 |
| 30/03/2009 | 59.136 | 64.564 | 59.235 |
| 31/03/2009 | 60.986 | 66.605 | 61.08 |
| 01/04/2009 | 61.941 | 67.347 | 62.021 |
| 02/04/2009 | 64.966 | 70.315 | 65.039 |
| 03/04/2009 | 64.38 | 69.388 | 64.453 |
| 06/04/2009 | 64.021 | 68.831 | 64.091 |
| 07/04/2009 | 63.536 | 68.646 | 63.621 |
| 08/04/2009 | 63.976 | 69.017 | 64.067 |
| 09/04/2009 | 65.466 | 69.944 | 65.556 |
| 10/04/2009 | 65.469 | 69.944 | 65.556 |
| 13/04/2009 | 65.508 | 69.944 | 65.556 |
| 14/04/2009 | 66.495 | 70.501 | 66.574 |
| 15/04/2009 | 66.078 | 70.315 | 66.142 |
| 16/04/2009 | 67.321 | 71.429 | 67.355 |
| 17/04/2009 | 68.431 | 72.171 | 68.479 |
| 20/04/2009 | 65.988 | 70.13 | 66.027 |
| 21/04/2009 | 66.11 | 70.13 | 66.192 |
| 22/04/2009 | 67.202 | 70.686 | 67.268 |
| 23/04/2009 | 66.926 | 70.501 | 66.989 |
| 24/04/2009 | 68.494 | 72.171 | 68.577 |
| 27/04/2009 | 68.619 | 72.356 | 68.7 |
| 28/04/2009 | 67.551 | 71.429 | 67.645 |
| 29/04/2009 | 69.044 | 72.727 | 69.126 |
| 30/04/2009 | 70.003 | 73.655 | 70.082 |
| 01/05/2009 | 70.041 | 73.655 | 70.165 |
| 04/05/2009 | 71.823 | 75.139 | 71.892 |
| 05/05/2009 | 71.559 | 74.954 | 71.639 |
| 06/05/2009 | 72.544 | 75.881 | 72.612 |
| 07/05/2009 | 72.065 | 75.325 | 72.143 |
| 08/05/2009 | 73.427 | 76.623 | 73.491 |
| 11/05/2009 | 72.394 | 75.696 | 72.467 |
| 12/05/2009 | 72.086 | 75.51 | 72.162 |
| 13/05/2009 | 70.287 | 74.026 | 70.389 |
| 14/05/2009 | 70.516 | 74.212 | 70.623 |
| 15/05/2009 | 70.973 | 74.583 | 71.073 |
| 18/05/2009 | 72.515 | 76.252 | 72.587 |
| 19/05/2009 | 73.622 | 77.365 | 73.737 |
| 20/05/2009 | 74.332 | 78.108 | 74.438 |
| 21/05/2009 | 72.97 | 78.108 | 73.104 |
| 22/05/2009 | 72.733 | 76.438 | 72.866 |
| 25/05/2009 | 72.918 | 76.623 | 73.046 |
| 26/05/2009 | 73.296 | 77.365 | 73.409 |
| 27/05/2009 | 73.671 | 77.737 | 73.784 |
| 28/05/2009 | 72.878 | 76.994 | 72.996 |
| 29/05/2009 | 72.962 | 76.994 | 73.08 |
| 01/06/2009 | 74.796 | 76.994 | 74.908 |
| 02/06/2009 | 75.067 | 79.035 | 75.177 |
| 03/06/2009 | 73.635 | 77.551 | 73.749 |
| 04/06/2009 | 73.752 | 77.922 | 73.858 |
| 05/06/2009 | 73.991 | 78.108 | 74.092 |
| 08/06/2009 | 73.199 | 77.18 | 73.309 |
| 09/06/2009 | 73.45 | 77.365 | 73.565 |
| 10/06/2009 | 74.31 | 78.293 | 74.418 |
| 11/06/2009 | 74.926 | 78.85 | 75.031 |
| 12/06/2009 | 74.747 | 78.664 | 74.952 |
| 15/06/2009 | 72.739 | 76.438 | 72.952 |
| 16/06/2009 | 72.528 | 76.438 | 72.745 |
| 17/06/2009 | 71.074 | 75.139 | 71.287 |
| 18/06/2009 | 71.714 | 76.067 | 71.946 |
| 19/06/2009 | 72.307 | 76.809 | 72.537 |
| 22/06/2009 | 70.22 | 74.583 | 70.445 |
| 23/06/2009 | 70.226 | 74.583 | 70.449 |
| 24/06/2009 | 71.954 | 76.252 | 72.179 |
| 25/06/2009 | 71.396 | 75.696 | 71.624 |
| 26/06/2009 | 71.296 | 75.51 | 71.522 |
| 29/06/2009 | 72.638 | 76.809 | 72.856 |
| 30/06/2009 | 71.949 | 76.067 | 72.171 |
| 01/07/2009 | 73.363 | 77.365 | 73.581 |
| 02/07/2009 | 71.396 | 75.325 | 71.625 |
| 03/07/2009 | 71.371 | 75.325 | 71.599 |
| 06/07/2009 | 70.588 | 74.583 | 70.815 |
| 07/07/2009 | 70.085 | 74.026 | 70.31 |
| 08/07/2009 | 69.304 | 73.284 | 69.531 |
| 09/07/2009 | 69.785 | 74.026 | 70.005 |
| 10/07/2009 | 68.922 | 73.098 | 69.149 |
| 13/07/2009 | 70.367 | 74.583 | 70.582 |
| 14/07/2009 | 71.097 | 75.51 | 71.302 |
| 15/07/2009 | 73.148 | 77.365 | 73.343 |
| 16/07/2009 | 73.493 | 77.922 | 73.685 |
| 17/07/2009 | 73.93 | 78.479 | 74.118 |
| 20/07/2009 | 74.708 | 79.221 | 74.889 |
| 21/07/2009 | 75.403 | 79.777 | 75.584 |
| 22/07/2009 | 75.627 | 79.963 | 75.81 |
| 23/07/2009 | 77.159 | 81.633 | 77.332 |
| 24/07/2009 | 77.101 | 81.633 | 77.276 |
| 27/07/2009 | 77.429 | 82.004 | 77.6 |
| 28/07/2009 | 76.8 | 81.076 | 76.977 |
| 29/07/2009 | 77.436 | 81.818 | 77.605 |
| 30/07/2009 | 79.071 | 83.673 | 79.232 |
| 31/07/2009 | 79.083 | 83.488 | 79.238 |
| 03/08/2009 | 80.157 | 84.601 | 80.305 |
| 04/08/2009 | 79.88 | 84.416 | 80.027 |
| 05/08/2009 | 79.328 | 83.673 | 79.477 |
| 06/08/2009 | 79.771 | 84.23 | 79.917 |
| 07/08/2009 | 80.763 | 85.343 | 80.901 |
| 10/08/2009 | 80.426 | 85.158 | 80.563 |
| 11/08/2009 | 79.225 | 83.859 | 79.37 |
| 12/08/2009 | 80.173 | 84.601 | 80.309 |
| 13/08/2009 | 80.82 | 85.343 | 80.955 |
| 14/08/2009 | 80.184 | 84.787 | 80.323 |
| 17/08/2009 | 78.516 | 83.117 | 78.668 |
| 18/08/2009 | 79.329 | 83.859 | 79.476 |
| 19/08/2009 | 79.314 | 83.859 | 79.463 |
| 20/08/2009 | 80.479 | 84.972 | 80.62 |
| 21/08/2009 | 82.591 | 87.199 | 82.719 |
| 24/08/2009 | 83.477 | 88.126 | 83.595 |
| 25/08/2009 | 83.949 | 88.683 | 84.068 |
| 26/08/2009 | 83.579 | 88.312 | 83.693 |
| 27/08/2009 | 83.204 | 87.941 | 83.314 |
| 28/08/2009 | 84.122 | 88.683 | 84.234 |
| 31/08/2009 | 83.345 | 87.941 | 83.454 |
| 01/09/2009 | 81.866 | 86.271 | 81.972 |
| 02/09/2009 | 81.158 | 85.714 | 81.263 |
| 03/09/2009 | 81.16 | 85.714 | 81.267 |
| 04/09/2009 | 82.234 | 86.827 | 82.343 |
| 07/09/2009 | 83.495 | 88.126 | 83.595 |
| 08/09/2009 | 83.784 | 88.312 | 83.88 |
| 09/09/2009 | 84.654 | 89.425 | 84.753 |
| 10/09/2009 | 84.643 | 89.425 | 84.739 |
| 11/09/2009 | 85.132 | 89.981 | 85.227 |
| 14/09/2009 | 84.969 | 89.981 | 85.062 |
| 15/09/2009 | 85.336 | 90.167 | 85.428 |
| 16/09/2009 | 86.535 | 91.466 | 86.624 |
| 17/09/2009 | 86.935 | 92.208 | 87.023 |
| 18/09/2009 | 86.834 | 92.022 | 86.919 |
| 21/09/2009 | 86.244 | 91.466 | 86.322 |
| 22/09/2009 | 86.743 | 92.022 | 86.82 |
| 23/09/2009 | 86.864 | 92.208 | 86.943 |
| 24/09/2009 | 85.551 | 90.724 | 85.625 |
| 25/09/2009 | 85.256 | 90.353 | 85.339 |
| 28/09/2009 | 86.83 | 92.022 | 86.898 |
| 29/09/2009 | 86.68 | 92.022 | 86.762 |
| 30/09/2009 | 86.33 | 91.466 | 86.407 |
| 01/10/2009 | 84.839 | 89.981 | 84.912 |
| 02/10/2009 | 83.331 | 88.497 | 83.399 |
| 05/10/2009 | 84.021 | 89.054 | 84.088 |
| 06/10/2009 | 86.136 | 91.466 | 86.208 |
| 07/10/2009 | 85.754 | 91.095 | 85.829 |
| 08/10/2009 | 86.776 | 92.208 | 86.841 |
| 09/10/2009 | 86.739 | 92.022 | 86.8 |
| 12/10/2009 | 87.717 | 93.135 | 87.775 |
| 13/10/2009 | 86.801 | 92.208 | 86.861 |
| 14/10/2009 | 88.617 | 94.249 | 88.682 |
| 15/10/2009 | 88.348 | 94.063 | 88.407 |
| 16/10/2009 | 87.387 | 92.95 | 87.456 |
| 19/10/2009 | 88.771 | 94.62 | 88.838 |
| 20/10/2009 | 88.332 | 94.063 | 88.4 |
| 21/10/2009 | 88.508 | 94.249 | 88.57 |
| 22/10/2009 | 87.517 | 93.135 | 87.578 |
| 23/10/2009 | 87.159 | 92.95 | 87.217 |
| 26/10/2009 | 85.779 | 91.28 | 85.837 |
| 27/10/2009 | 85.718 | 91.095 | 85.781 |
| 28/10/2009 | 83.95 | 88.868 | 84.017 |
| 29/10/2009 | 85.386 | 90.724 | 85.452 |
| 30/10/2009 | 83.584 | 88.497 | 83.647 |
| 02/11/2009 | 83.943 | 89.054 | 83.997 |
| 03/11/2009 | 82.667 | 87.57 | 82.719 |
| 04/11/2009 | 84.185 | 89.054 | 84.234 |
| 05/11/2009 | 84.871 | 89.796 | 84.919 |
| 06/11/2009 | 84.903 | 89.981 | 84.947 |
| 09/11/2009 | 86.678 | 92.022 | 86.719 |
| 10/11/2009 | 86.431 | 91.651 | 86.472 |
| 11/11/2009 | 87.048 | 92.579 | 87.09 |
| 12/11/2009 | 86.952 | 92.393 | 86.99 |
| 13/11/2009 | 87.117 | 92.579 | 87.158 |
| 16/11/2009 | 88.306 | 94.063 | 88.346 |
| 17/11/2009 | 87.682 | 93.321 | 87.721 |
| 18/11/2009 | 87.795 | 93.321 | 87.832 |
| 19/11/2009 | 86.307 | 91.837 | 86.349 |
| 20/11/2009 | 85.662 | 90.909 | 85.702 |
| 23/11/2009 | 87.55 | 93.135 | 87.593 |
| 24/11/2009 | 86.924 | 92.393 | 86.966 |
| 25/11/2009 | 87.305 | 92.95 | 87.346 |
| 26/11/2009 | 84.587 | 89.981 | 84.63 |
| 27/11/2009 | 85.591 | 91.095 | 85.637 |
| 30/11/2009 | 84.53 | 89.981 | 84.577 |
| 01/12/2009 | 86.636 | 92.208 | 86.687 |
| 02/12/2009 | 86.982 | 92.579 | 87.032 |
| 03/12/2009 | 87.053 | 92.764 | 87.101 |
| 04/12/2009 | 87.957 | 93.692 | 88.006 |
| 07/12/2009 | 87.533 | 93.321 | 87.575 |
| 08/12/2009 | 86.247 | 91.837 | 86.287 |
| 09/12/2009 | 85.337 | 90.909 | 85.377 |
| 10/12/2009 | 86.171 | 91.837 | 86.214 |
| 11/12/2009 | 86.45 | 92.208 | 86.488 |
| 14/12/2009 | 87.077 | 92.764 | 87.113 |
| 15/12/2009 | 87.118 | 92.95 | 87.136 |
| 16/12/2009 | 88.216 | 94.249 | 88.253 |
| 17/12/2009 | 87.357 | 93.506 | 87.392 |
| 18/12/2009 | 86.916 | 92.764 | 86.95 |
| 21/12/2009 | 88.09 | 94.249 | 88.118 |
| 22/12/2009 | 88.786 | 94.991 | 88.81 |
| 23/12/2009 | 89.049 | 95.176 | 89.073 |
| 24/12/2009 | 89.011 | 95.176 | 89.036 |
| 25/12/2009 | 89.011 | 95.176 | 89.036 |
| 28/12/2009 | 89.587 | 95.176 | 89.036 |
| 29/12/2009 | 89.905 | 96.289 | 89.929 |
| 30/12/2009 | 89.265 | 95.547 | 89.287 |
| 31/12/2009 | 89.322 | 95.547 | 89.344 |
| 01/01/2010 | 89.322 | 95.547 | 89.344 |
| 04/01/2010 | 90.904 | 97.217 | 90.917 |
| 05/01/2010 | 90.857 | 97.217 | 90.867 |
| 06/01/2010 | 90.942 | 97.217 | 90.951 |
| 07/01/2010 | 90.954 | 97.403 | 90.963 |
| 08/01/2010 | 91.366 | 97.959 | 91.373 |
| 11/01/2010 | 91.29 | 97.588 | 91.296 |
| 12/01/2010 | 90.27 | 96.475 | 90.276 |
| 13/01/2010 | 90.441 | 96.475 | 90.449 |
| 14/01/2010 | 91.001 | 97.032 | 91.008 |
| 15/01/2010 | 89.918 | 95.547 | 89.924 |
| 18/01/2010 | 90.367 | 95.918 | 90.369 |
| 19/01/2010 | 90.899 | 96.289 | 90.897 |
| 20/01/2010 | 89.282 | 94.434 | 89.275 |
| 21/01/2010 | 88.188 | 92.95 | 88.178 |
| 22/01/2010 | 87.346 | 92.022 | 87.337 |
| 25/01/2010 | 86.655 | 91.28 | 86.646 |
| 26/01/2010 | 87.002 | 91.651 | 86.996 |
| 27/01/2010 | 86.221 | 90.538 | 86.222 |
| 28/01/2010 | 85.251 | 89.425 | 85.241 |
| 29/01/2010 | 86.271 | 90.353 | 86.256 |
| 01/02/2010 | 86.881 | 91.095 | 86.863 |
| 02/02/2010 | 87.791 | 92.022 | 87.772 |
| 03/02/2010 | 87.274 | 91.466 | 87.254 |
| 04/02/2010 | 84.701 | 88.683 | 84.687 |
| 05/02/2010 | 82.69 | 86.642 | 82.682 |
| 08/02/2010 | 83.359 | 87.199 | 83.356 |
| 09/02/2010 | 83.567 | 87.384 | 83.562 |
| 10/02/2010 | 84.208 | 87.941 | 84.192 |
| 11/02/2010 | 84.095 | 87.941 | 84.083 |
| 12/02/2010 | 83.816 | 87.57 | 83.8 |
| 15/02/2010 | 84.033 | 87.941 | 84.016 |
| 16/02/2010 | 84.966 | 88.868 | 84.948 |
| 17/02/2010 | 86.097 | 90.167 | 86.075 |
| 18/02/2010 | 86.626 | 90.724 | 86.605 |
| 19/02/2010 | 87.23 | 91.466 | 87.201 |
| 22/02/2010 | 86.969 | 90.909 | 86.937 |
| 23/02/2010 | 85.778 | 89.796 | 85.745 |
| 24/02/2010 | 85.994 | 89.981 | 85.963 |
| 25/02/2010 | 84.721 | 88.683 | 84.69 |
| 26/02/2010 | 85.892 | 89.796 | 85.862 |
| 01/03/2010 | 87.254 | 91.28 | 87.222 |
| 02/03/2010 | 88.023 | 92.022 | 87.989 |
| 03/03/2010 | 88.69 | 92.764 | 88.655 |
| 04/03/2010 | 88.74 | 92.579 | 88.705 |
| 05/03/2010 | 90.171 | 94.063 | 90.138 |
| 08/03/2010 | 90.254 | 94.063 | 90.216 |
| 09/03/2010 | 90.234 | 94.063 | 90.197 |
| 10/03/2010 | 91.026 | 94.805 | 90.989 |
| 11/03/2010 | 90.698 | 94.434 | 90.658 |
| 12/03/2010 | 90.889 | 94.62 | 90.855 |
| 15/03/2010 | 90.298 | 94.063 | 90.266 |
| 16/03/2010 | 91.23 | 94.991 | 91.199 |
| 17/03/2010 | 91.892 | 95.733 | 91.859 |
| 18/03/2010 | 91.541 | 95.547 | 91.511 |
| 19/03/2010 | 91.4 | 95.362 | 91.363 |
| 22/03/2010 | 91.231 | 95.176 | 91.189 |
| 23/03/2010 | 91.909 | 95.918 | 91.868 |
| 24/03/2010 | 91.889 | 95.918 | 91.85 |
| 25/03/2010 | 92.898 | 97.032 | 92.859 |
| 26/03/2010 | 92.596 | 96.475 | 92.558 |
| 29/03/2010 | 92.712 | 96.66 | 92.676 |
| 30/03/2010 | 92.488 | 96.475 | 92.452 |
| 31/03/2010 | 92.458 | 96.289 | 92.42 |
| 01/04/2010 | 93.73 | 97.774 | 93.683 |
| 02/04/2010 | 93.73 | 97.774 | 93.683 |
| 05/04/2010 | 93.576 | 97.774 | 93.683 |
| 06/04/2010 | 94.045 | 98.145 | 93.992 |
| 07/04/2010 | 93.635 | 97.774 | 93.583 |
| 08/04/2010 | 92.734 | 96.66 | 92.681 |
| 09/04/2010 | 94.071 | 97.959 | 94.021 |
| 12/04/2010 | 94.285 | 98.145 | 94.24 |
| 13/04/2010 | 94.016 | 97.959 | 93.969 |
| 14/04/2010 | 94.632 | 98.516 | 94.586 |
| 15/04/2010 | 95.001 | 98.887 | 94.955 |
| 16/04/2010 | 93.525 | 97.217 | 93.481 |
| 19/04/2010 | 93.01 | 96.66 | 92.971 |
| 20/04/2010 | 94.282 | 97.959 | 94.234 |
| 21/04/2010 | 93.574 | 97.403 | 93.521 |
| 22/04/2010 | 92.261 | 96.104 | 92.211 |
| 23/04/2010 | 93.214 | 97.032 | 93.165 |
| 26/04/2010 | 93.896 | 97.959 | 93.85 |
| 27/04/2010 | 91.059 | 95.176 | 91.026 |
| 28/04/2010 | 89.598 | 93.692 | 89.578 |
| 29/04/2010 | 91.096 | 94.991 | 91.061 |
| 30/04/2010 | 90.835 | 94.62 | 90.81 |
| 03/05/2010 | 91.073 | 94.805 | 90.81 |
| 04/05/2010 | 88.222 | 92.208 | 88.224 |
| 05/05/2010 | 87.005 | 91.095 | 87.039 |
| 06/05/2010 | 85.707 | 89.981 | 85.753 |
| 07/05/2010 | 82.567 | 86.827 | 82.648 |
| 10/05/2010 | 88.98 | 92.95 | 88.99 |
| 11/05/2010 | 88.696 | 92.764 | 88.71 |
| 12/05/2010 | 90.162 | 94.249 | 90.154 |
| 13/05/2010 | 90.256 | 94.249 | 90.244 |
| 14/05/2010 | 86.95 | 91.28 | 87.022 |
| 17/05/2010 | 86.892 | 91.28 | 86.977 |
| 18/05/2010 | 88.335 | 92.764 | 88.407 |
| 19/05/2010 | 85.744 | 89.981 | 85.856 |
| 20/05/2010 | 83.92 | 88.126 | 84.065 |
| 21/05/2010 | 83.708 | 87.57 | 83.84 |
| 24/05/2010 | 83.705 | 87.57 | 83.837 |
| 25/05/2010 | 81.511 | 85.714 | 81.685 |
| 26/05/2010 | 83.285 | 87.57 | 83.447 |
| 27/05/2010 | 85.756 | 89.981 | 85.908 |
| 28/05/2010 | 85.7 | 89.796 | 85.864 |
| 31/05/2010 | 85.823 | 90.167 | 85.998 |
| 01/06/2010 | 85.78 | 90.167 | 85.953 |
| 02/06/2010 | 85.978 | 90.538 | 86.159 |
| 03/06/2010 | 87.18 | 92.022 | 87.356 |
| 04/06/2010 | 85.183 | 90.167 | 85.371 |
| 07/06/2010 | 84.521 | 89.61 | 84.721 |
| 08/06/2010 | 83.931 | 89.054 | 84.139 |
| 09/06/2010 | 85.53 | 90.724 | 85.731 |
| 10/06/2010 | 87.088 | 92.208 | 87.278 |
| 11/06/2010 | 87.644 | 92.393 | 87.806 |
| 14/06/2010 | 88.902 | 93.506 | 89.066 |
| 15/06/2010 | 89.718 | 94.434 | 89.883 |
| 16/06/2010 | 89.67 | 94.434 | 89.836 |
| 17/06/2010 | 90.038 | 94.805 | 90.199 |
| 18/06/2010 | 90.414 | 95.176 | 90.569 |
| 21/06/2010 | 91.43 | 96.104 | 91.579 |
| 22/06/2010 | 90.917 | 95.733 | 91.075 |
| 23/06/2010 | 89.712 | 94.62 | 89.879 |
| 24/06/2010 | 87.994 | 92.95 | 88.172 |
| 25/06/2010 | 87.577 | 92.393 | 87.763 |
| 28/06/2010 | 88.745 | 93.692 | 88.92 |
| 29/06/2010 | 85.75 | 90.909 | 85.944 |
| 30/06/2010 | 85.981 | 91.095 | 86.173 |
| 01/07/2010 | 84.003 | 88.868 | 84.207 |
| 02/07/2010 | 83.966 | 88.683 | 84.168 |
| 05/07/2010 | 83.739 | 88.497 | 83.943 |
| 06/07/2010 | 85.819 | 90.538 | 86.007 |
| 07/07/2010 | 87.13 | 91.651 | 87.306 |
| 08/07/2010 | 87.989 | 92.393 | 88.156 |
| 09/07/2010 | 88.546 | 93.135 | 88.71 |
| 12/07/2010 | 88.771 | 93.321 | 88.929 |
| 13/07/2010 | 90.469 | 95.176 | 90.61 |
| 14/07/2010 | 90.54 | 95.362 | 90.679 |
| 15/07/2010 | 89.602 | 94.434 | 89.753 |
| 16/07/2010 | 87.759 | 92.579 | 87.927 |
| 19/07/2010 | 87.274 | 92.022 | 87.446 |
| 20/07/2010 | 87.106 | 91.651 | 87.273 |
| 21/07/2010 | 87.829 | 92.393 | 87.984 |
| 22/07/2010 | 89.892 | 94.434 | 90.034 |
| 23/07/2010 | 89.957 | 94.249 | 90.099 |
| 26/07/2010 | 90.437 | 94.62 | 90.57 |
| 27/07/2010 | 90.777 | 94.62 | 90.909 |
| 28/07/2010 | 90.597 | 94.249 | 90.732 |
| 29/07/2010 | 90.39 | 93.878 | 90.52 |
| 30/07/2010 | 90.055 | 93.692 | 90.182 |
| 02/08/2010 | 92.352 | 95.918 | 92.466 |
| 03/08/2010 | 92.336 | 95.733 | 92.442 |
| 04/08/2010 | 92.43 | 95.918 | 92.537 |
| 05/08/2010 | 92.339 | 95.733 | 92.442 |
| 06/08/2010 | 91.228 | 94.805 | 91.342 |
| 09/08/2010 | 92.332 | 95.918 | 92.432 |
| 10/08/2010 | 91.518 | 95.176 | 91.628 |
| 11/08/2010 | 89.464 | 93.135 | 89.588 |
| 12/08/2010 | 89.531 | 93.321 | 89.655 |
| 13/08/2010 | 89.466 | 93.321 | 89.591 |
| 16/08/2010 | 89.531 | 93.506 | 89.65 |
| 17/08/2010 | 90.758 | 94.62 | 90.863 |
| 18/08/2010 | 90.583 | 94.434 | 90.689 |
| 19/08/2010 | 89.286 | 93.135 | 89.399 |
| 20/08/2010 | 88.258 | 92.208 | 88.376 |
| 23/08/2010 | 88.688 | 92.579 | 88.801 |
| 24/08/2010 | 87.355 | 91.28 | 87.481 |
| 25/08/2010 | 86.632 | 90.538 | 86.758 |
| 26/08/2010 | 87.318 | 91.095 | 87.438 |
| 27/08/2010 | 88.005 | 91.837 | 88.124 |
| 30/08/2010 | 87.868 | 91.837 | 88.124 |
| 31/08/2010 | 88.135 | 92.022 | 88.246 |
| 01/09/2010 | 90.697 | 94.62 | 90.806 |
| 02/09/2010 | 90.823 | 94.805 | 90.934 |
| 03/09/2010 | 91.534 | 95.362 | 91.647 |
| 06/09/2010 | 91.859 | 95.733 | 91.97 |
| 07/09/2010 | 91.284 | 95.362 | 91.391 |
| 08/09/2010 | 92.004 | 96.104 | 92.107 |
| 09/09/2010 | 92.905 | 97.032 | 93.004 |
| 10/09/2010 | 92.854 | 97.032 | 92.952 |
| 13/09/2010 | 93.594 | 97.774 | 93.69 |
| 14/09/2010 | 93.739 | 97.959 | 93.827 |
| 15/09/2010 | 93.165 | 97.403 | 93.251 |
| 16/09/2010 | 92.483 | 96.66 | 92.568 |
| 17/09/2010 | 92.192 | 96.475 | 92.275 |
| 20/09/2010 | 93.56 | 97.774 | 93.644 |
| 21/09/2010 | 93.366 | 97.588 | 93.451 |
| 22/09/2010 | 92.186 | 96.289 | 92.273 |
| 23/09/2010 | 91.744 | 95.918 | 91.828 |
| 24/09/2010 | 93.053 | 97.403 | 93.137 |
| 27/09/2010 | 92.585 | 96.846 | 92.667 |
| 28/09/2010 | 92.592 | 97.032 | 92.671 |
| 29/09/2010 | 92.133 | 96.66 | 92.212 |
| 30/09/2010 | 91.915 | 96.289 | 91.99 |
| 01/10/2010 | 91.406 | 95.733 | 91.474 |
| 04/10/2010 | 90.654 | 94.991 | 90.728 |
| 05/10/2010 | 92.111 | 96.289 | 92.182 |
| 06/10/2010 | 92.695 | 96.846 | 92.756 |
| 07/10/2010 | 92.764 | 96.846 | 92.822 |
| 08/10/2010 | 92.774 | 96.846 | 92.833 |
| 11/10/2010 | 93.095 | 97.217 | 93.176 |
| 12/10/2010 | 92.955 | 97.217 | 93.018 |
| 13/10/2010 | 94.512 | 98.701 | 94.572 |
| 14/10/2010 | 94.279 | 98.516 | 94.336 |
| 15/10/2010 | 94.357 | 98.516 | 94.42 |
| 18/10/2010 | 94.655 | 98.701 | 94.717 |
| 19/10/2010 | 94.126 | 97.959 | 94.195 |
| 20/10/2010 | 94.612 | 98.33 | 94.679 |
| 21/10/2010 | 95.488 | 99.443 | 95.548 |
| 22/10/2010 | 95.199 | 99.072 | 95.254 |
| 25/10/2010 | 95.503 | 99.629 | 95.551 |
| 26/10/2010 | 94.803 | 98.887 | 94.85 |
| 27/10/2010 | 94.196 | 98.33 | 94.243 |
| 28/10/2010 | 94.445 | 98.33 | 94.494 |
| 29/10/2010 | 94.366 | 98.516 | 94.417 |
| 01/11/2010 | 94.227 | 98.33 | 94.277 |
| 02/11/2010 | 94.909 | 99.072 | 94.961 |
| 03/11/2010 | 94.204 | 98.516 | 94.256 |
| 04/11/2010 | 95.709 | 99.814 | 95.754 |
| 05/11/2010 | 95.78 | 100 | 95.824 |
| 08/11/2010 | 95.734 | 100 | 95.831 |
| 09/11/2010 | 96.458 | 100.742 | 96.547 |
| 10/11/2010 | 95.47 | 99.629 | 95.562 |
| 11/11/2010 | 95.014 | 99.443 | 95.1 |
| 12/11/2010 | 94.703 | 98.887 | 94.786 |
| 15/11/2010 | 95.504 | 99.814 | 95.581 |
| 16/11/2010 | 93.594 | 97.959 | 93.676 |
| 17/11/2010 | 94.146 | 98.516 | 94.224 |
| 18/11/2010 | 95.552 | 100 | 95.627 |
| 19/11/2010 | 95.274 | 99.814 | 95.349 |
| 22/11/2010 | 94.584 | 99.443 | 94.661 |
| 23/11/2010 | 92.834 | 97.774 | 92.924 |
| 24/11/2010 | 93.768 | 98.887 | 93.857 |
| 25/11/2010 | 94.146 | 99.629 | 94.227 |
| 26/11/2010 | 93.69 | 99.258 | 93.779 |
| 29/11/2010 | 92.117 | 97.774 | 92.197 |
| 30/11/2010 | 91.777 | 97.588 | 91.859 |
| 01/12/2010 | 93.773 | 99.443 | 93.862 |
| 02/12/2010 | 95.482 | 101.113 | 95.57 |
| 03/12/2010 | 95.552 | 101.113 | 95.639 |
| 06/12/2010 | 95.33 | 101.113 | 95.406 |
| 07/12/2010 | 96.118 | 101.855 | 96.198 |
| 08/12/2010 | 96.472 | 102.041 | 96.562 |
| 09/12/2010 | 96.853 | 102.226 | 96.953 |
| 10/12/2010 | 96.936 | 102.412 | 97.032 |
| 13/12/2010 | 97.366 | 102.783 | 97.456 |
| 14/12/2010 | 97.685 | 103.154 | 97.778 |
| 15/12/2010 | 97.445 | 103.154 | 97.531 |
| 16/12/2010 | 97.605 | 103.154 | 97.696 |
| 17/12/2010 | 97.237 | 102.968 | 97.322 |
| 20/12/2010 | 97.822 | 103.525 | 97.898 |
| 21/12/2010 | 98.989 | 104.453 | 99.072 |
| 22/12/2010 | 99.027 | 104.638 | 99.108 |
| 23/12/2010 | 98.959 | 104.638 | 99.025 |
| 24/12/2010 | 98.764 | 104.453 | 98.829 |
| 27/12/2010 | 97.843 | 104.453 | 98.829 |
| 28/12/2010 | 98.102 | 104.453 | 98.829 |
| 29/12/2010 | 98.526 | 104.082 | 98.585 |
| 30/12/2010 | 97.451 | 102.968 | 97.507 |
| 31/12/2010 | 97.027 | 102.597 | 97.081 |
| 03/01/2011 | 98.541 | 102.597 | 97.081 |
| 04/01/2011 | 98.352 | 103.525 | 98.4 |
| 05/01/2011 | 97.935 | 102.968 | 97.986 |
| 06/01/2011 | 98.194 | 103.34 | 98.247 |
| 07/01/2011 | 97.784 | 102.968 | 97.833 |
| 10/01/2011 | 96.556 | 102.041 | 96.603 |
| 11/01/2011 | 97.852 | 103.34 | 97.902 |
| 12/01/2011 | 99.629 | 104.638 | 99.683 |
| 13/01/2011 | 99.446 | 104.082 | 99.521 |
| 14/01/2011 | 99.475 | 104.082 | 99.55 |
| 17/01/2011 | 99.437 | 104.082 | 99.514 |
| 18/01/2011 | 100.399 | 104.824 | 100.475 |
| 19/01/2011 | 99.368 | 103.525 | 99.449 |
| 20/01/2011 | 98.655 | 102.412 | 98.757 |
| 21/01/2011 | 99.597 | 103.154 | 99.704 |
| 24/01/2011 | 99.906 | 103.525 | 100.012 |
| 25/01/2011 | 99.634 | 103.525 | 99.741 |
| 26/01/2011 | 100.395 | 104.453 | 100.497 |
| 27/01/2011 | 100.59 | 104.638 | 100.688 |
| 28/01/2011 | 99.896 | 103.896 | 99.963 |
| 31/01/2011 | 99.623 | 103.525 | 99.695 |
| 01/02/2011 | 100.979 | 105.009 | 101.053 |
| 02/02/2011 | 100.845 | 104.824 | 100.92 |
| 03/02/2011 | 100.651 | 104.638 | 100.724 |
| 04/02/2011 | 100.895 | 104.824 | 100.957 |
| 07/02/2011 | 101.722 | 105.566 | 101.776 |
| 08/02/2011 | 101.828 | 105.566 | 101.881 |
| 09/02/2011 | 101.53 | 105.195 | 101.586 |
| 10/02/2011 | 101.251 | 105.195 | 101.312 |
| 11/02/2011 | 101.592 | 105.566 | 101.653 |
| 14/02/2011 | 101.831 | 105.751 | 101.877 |
| 15/02/2011 | 101.933 | 105.937 | 101.974 |
| 16/02/2011 | 102.625 | 106.494 | 102.665 |
| 17/02/2011 | 102.736 | 106.679 | 102.781 |
| 18/02/2011 | 102.789 | 106.679 | 102.832 |
| 21/02/2011 | 101.419 | 105.38 | 101.462 |
| 22/02/2011 | 100.873 | 104.638 | 100.91 |
| 23/02/2011 | 99.953 | 103.896 | 99.991 |
| 24/02/2011 | 99.587 | 103.525 | 99.621 |
| 25/02/2011 | 100.708 | 104.638 | 100.731 |
| 28/02/2011 | 101.638 | 105.566 | 101.65 |
| 01/03/2011 | 101.079 | 105.009 | 101.094 |
| 02/03/2011 | 100.372 | 104.453 | 100.385 |
| 03/03/2011 | 100.507 | 104.638 | 100.52 |
| 04/03/2011 | 99.926 | 104.082 | 99.94 |
| 07/03/2011 | 99.589 | 103.711 | 99.6 |
| 08/03/2011 | 99.972 | 104.082 | 99.981 |
| 09/03/2011 | 99.794 | 103.896 | 99.803 |
| 10/03/2011 | 98.887 | 102.968 | 98.897 |
| 11/03/2011 | 98.005 | 102.041 | 98.023 |
| 14/03/2011 | 96.853 | 100.742 | 96.872 |
| 15/03/2011 | 94.546 | 98.33 | 94.569 |
| 16/03/2011 | 93.095 | 96.66 | 93.118 |
| 17/03/2011 | 94.896 | 98.516 | 94.914 |
| 18/03/2011 | 95.251 | 98.887 | 95.27 |
| 21/03/2011 | 97.061 | 100.557 | 97.075 |
| 22/03/2011 | 96.767 | 100.371 | 96.781 |
| 23/03/2011 | 97.331 | 100.928 | 97.344 |
| 24/03/2011 | 98.572 | 102.226 | 98.585 |
| 25/03/2011 | 98.614 | 102.412 | 98.635 |
| 28/03/2011 | 98.794 | 102.597 | 98.813 |
| 29/03/2011 | 98.744 | 102.597 | 98.763 |
| 30/03/2011 | 99.538 | 103.525 | 99.553 |
| 31/03/2011 | 98.879 | 102.968 | 98.895 |
| 01/04/2011 | 100.143 | 104.267 | 100.175 |
| 04/04/2011 | 100.217 | 104.267 | 100.251 |
| 05/04/2011 | 100.14 | 104.267 | 100.176 |
| 06/04/2011 | 100.571 | 104.638 | 100.608 |
| 07/04/2011 | 100.285 | 104.267 | 100.321 |
| 08/04/2011 | 100.691 | 104.638 | 100.721 |
| 11/04/2011 | 100.334 | 104.453 | 100.365 |
| 12/04/2011 | 99.062 | 103.154 | 99.093 |
| 13/04/2011 | 99.726 | 103.896 | 99.757 |
| 14/04/2011 | 99.117 | 103.525 | 99.16 |
| 15/04/2011 | 99.299 | 103.896 | 99.353 |
| 18/04/2011 | 97.464 | 102.226 | 97.515 |
| 19/04/2011 | 98.006 | 102.783 | 98.057 |
| 20/04/2011 | 99.926 | 104.824 | 99.978 |
| 21/04/2011 | 100.473 | 105.38 | 100.543 |
| 22/04/2011 | 100.473 | 105.38 | 100.543 |
| 25/04/2011 | 100.498 | 105.38 | 100.543 |
| 26/04/2011 | 101.057 | 105.751 | 101.11 |
| 27/04/2011 | 101.424 | 105.937 | 101.477 |
| 28/04/2011 | 102.097 | 106.308 | 102.151 |
| 29/04/2011 | 102.57 | 106.865 | 102.621 |
| 02/05/2011 | 102.823 | 107.236 | 102.151 |
| 03/05/2011 | 102.456 | 107.05 | 102.526 |
| 04/05/2011 | 101.133 | 105.751 | 101.219 |
| 05/05/2011 | 100.82 | 105.566 | 100.922 |
| 06/05/2011 | 102.018 | 106.865 | 102.146 |
| 09/05/2011 | 101.366 | 106.308 | 101.497 |
| 10/05/2011 | 102.283 | 107.05 | 102.415 |
| 11/05/2011 | 102.546 | 107.236 | 102.681 |
| 12/05/2011 | 101.988 | 106.865 | 102.12 |
| 13/05/2011 | 101.667 | 106.679 | 101.835 |
| 16/05/2011 | 101.609 | 106.679 | 101.784 |
| 17/05/2011 | 100.415 | 105.566 | 100.593 |
| 18/05/2011 | 100.924 | 105.937 | 101.105 |
| 19/05/2011 | 101.567 | 106.679 | 101.751 |
| 20/05/2011 | 101.092 | 106.308 | 101.26 |
| 23/05/2011 | 99.331 | 104.638 | 99.524 |
| 24/05/2011 | 99.566 | 105.009 | 99.759 |
| 25/05/2011 | 100.192 | 105.566 | 100.392 |
| 26/05/2011 | 99.886 | 105.38 | 100.09 |
| 27/05/2011 | 100.638 | 106.122 | 100.862 |
| 30/05/2011 | 100.559 | 106.122 | 100.862 |
| 31/05/2011 | 101.792 | 107.421 | 102.008 |
| 01/06/2011 | 101.115 | 106.865 | 101.332 |
| 02/06/2011 | 99.96 | 106.865 | 100.17 |
| 03/06/2011 | 99.673 | 105.195 | 99.872 |
| 06/06/2011 | 98.98 | 104.638 | 99.196 |
| 07/06/2011 | 98.764 | 104.267 | 98.986 |
| 08/06/2011 | 97.712 | 103.34 | 97.934 |
| 09/06/2011 | 98.55 | 104.267 | 98.772 |
| 10/06/2011 | 97.28 | 102.783 | 97.501 |
| 13/06/2011 | 97.392 | 102.783 | 97.61 |
| 14/06/2011 | 98.346 | 103.896 | 98.573 |
| 15/06/2011 | 97.059 | 102.783 | 97.282 |
| 16/06/2011 | 96.704 | 102.412 | 96.934 |
| 17/06/2011 | 97.215 | 102.968 | 97.448 |
| 20/06/2011 | 96.593 | 102.597 | 96.82 |
| 21/06/2011 | 98.174 | 104.082 | 98.416 |
| 22/06/2011 | 97.786 | 103.711 | 98.034 |
| 23/06/2011 | 96.107 | 101.855 | 96.345 |
| 24/06/2011 | 95.829 | 101.855 | 96.064 |
| 27/06/2011 | 95.938 | 101.855 | 96.17 |
| 28/06/2011 | 96.538 | 102.412 | 96.777 |
| 29/06/2011 | 98.284 | 104.082 | 98.526 |
| 30/06/2011 | 99.467 | 105.009 | 99.711 |
| 01/07/2011 | 100.173 | 105.566 | 100.424 |
| 04/07/2011 | 100.319 | 105.751 | 100.566 |
| 05/07/2011 | 100.098 | 105.751 | 100.358 |
| 06/07/2011 | 99.689 | 105.751 | 99.931 |
| 07/07/2011 | 100.097 | 106.122 | 100.351 |
| 08/07/2011 | 98.899 | 105.195 | 99.134 |
| 11/07/2011 | 96.984 | 103.711 | 97.214 |
| 12/07/2011 | 96.422 | 102.968 | 96.647 |
| 13/07/2011 | 97.18 | 103.525 | 97.413 |
| 14/07/2011 | 96.367 | 102.783 | 96.601 |
| 15/07/2011 | 95.942 | 102.783 | 96.188 |
| 18/07/2011 | 94.146 | 100.928 | 94.386 |
| 19/07/2011 | 95.097 | 101.67 | 95.34 |
| 20/07/2011 | 96.509 | 102.783 | 96.757 |
| 21/07/2011 | 97.755 | 103.711 | 98.022 |
| 22/07/2011 | 98.208 | 104.082 | 98.47 |
| 25/07/2011 | 97.919 | 104.267 | 98.174 |
| 26/07/2011 | 97.445 | 103.711 | 97.7 |
| 27/07/2011 | 96.211 | 102.783 | 96.46 |
| 28/07/2011 | 95.875 | 102.597 | 96.128 |
| 29/07/2011 | 95.307 | 101.855 | 95.555 |
| 01/08/2011 | 93.858 | 100.928 | 94.103 |
| 02/08/2011 | 91.681 | 98.701 | 91.912 |
| 03/08/2011 | 89.909 | 96.846 | 90.139 |
| 04/08/2011 | 86.578 | 93.506 | 86.8 |
| 05/08/2011 | 85.348 | 92.022 | 85.568 |
| 08/08/2011 | 81.78 | 88.497 | 81.994 |
| 09/08/2011 | 82.995 | 90.167 | 83.199 |
| 10/08/2011 | 79.655 | 86.642 | 79.829 |
| 11/08/2011 | 81.48 | 88.126 | 81.674 |
| 12/08/2011 | 84.422 | 91.095 | 84.623 |
| 15/08/2011 | 84.703 | 91.28 | 84.903 |
| 16/08/2011 | 84.344 | 91.095 | 84.546 |
| 17/08/2011 | 84.602 | 91.651 | 84.807 |
| 18/08/2011 | 80.357 | 87.57 | 80.549 |
| 19/08/2011 | 78.868 | 86.085 | 79.056 |
| 22/08/2011 | 79.571 | 86.827 | 79.758 |
| 23/08/2011 | 80.141 | 87.384 | 80.33 |
| 24/08/2011 | 81.506 | 88.683 | 81.72 |
| 25/08/2011 | 80.751 | 87.941 | 80.969 |
| 26/08/2011 | 80.066 | 87.199 | 80.292 |
| 29/08/2011 | 81.542 | 88.497 | 80.292 |
| 30/08/2011 | 81.774 | 88.868 | 82.001 |
| 31/08/2011 | 84.305 | 91.466 | 84.537 |
| 01/09/2011 | 84.805 | 92.208 | 85.038 |
| 02/09/2011 | 82.445 | 90.167 | 82.67 |
| 05/09/2011 | 78.743 | 86.271 | 78.954 |
| 06/09/2011 | 77.657 | 85.529 | 77.868 |
| 07/09/2011 | 80.218 | 87.941 | 80.432 |
| 08/09/2011 | 80.496 | 88.126 | 80.71 |
| 09/09/2011 | 77.926 | 85.714 | 78.134 |
| 12/09/2011 | 75.545 | 83.302 | 75.751 |
| 13/09/2011 | 76.485 | 83.673 | 76.69 |
| 14/09/2011 | 77.965 | 85.343 | 78.175 |
| 15/09/2011 | 79.863 | 87.013 | 80.078 |
| 16/09/2011 | 80.194 | 87.199 | 80.406 |
| 19/09/2011 | 78.215 | 85.529 | 78.421 |
| 20/09/2011 | 79.748 | 87.199 | 79.958 |
| 21/09/2011 | 78.531 | 85.9 | 78.738 |
| 22/09/2011 | 74.894 | 82.375 | 75.09 |
| 23/09/2011 | 75.325 | 82.746 | 75.523 |
| 26/09/2011 | 76.916 | 84.416 | 77.12 |
| 27/09/2011 | 80.524 | 87.941 | 80.738 |
| 28/09/2011 | 79.771 | 87.199 | 79.982 |
| 29/09/2011 | 80.809 | 87.941 | 81.023 |
| 30/09/2011 | 79.51 | 86.642 | 79.728 |
| 03/10/2011 | 78.356 | 85.714 | 78.57 |
| 04/10/2011 | 76.37 | 83.859 | 76.578 |
| 05/10/2011 | 78.755 | 86.085 | 78.972 |
| 06/10/2011 | 80.927 | 88.312 | 81.152 |
| 07/10/2011 | 81.358 | 89.054 | 81.579 |
| 10/10/2011 | 83.085 | 90.724 | 83.308 |
| 11/10/2011 | 82.855 | 90.538 | 83.076 |
| 12/10/2011 | 84.617 | 92.022 | 84.841 |
| 13/10/2011 | 83.384 | 90.909 | 83.603 |
| 14/10/2011 | 84.27 | 91.837 | 84.492 |
| 17/10/2011 | 83.127 | 91.095 | 83.35 |
| 18/10/2011 | 82.974 | 90.538 | 83.2 |
| 19/10/2011 | 83.261 | 90.909 | 83.498 |
| 20/10/2011 | 81.968 | 89.796 | 82.202 |
| 21/10/2011 | 84.206 | 92.022 | 84.445 |
| 24/10/2011 | 85.232 | 92.95 | 85.472 |
| 25/10/2011 | 84.533 | 92.022 | 84.769 |
| 26/10/2011 | 84.504 | 92.022 | 84.736 |
| 27/10/2011 | 88.436 | 95.733 | 88.681 |
| 28/10/2011 | 88.178 | 95.733 | 88.422 |
| 31/10/2011 | 85.759 | 93.321 | 85.994 |
| 01/11/2011 | 82.015 | 89.425 | 82.24 |
| 02/11/2011 | 82.974 | 90.538 | 83.2 |
| 03/11/2011 | 84.904 | 92.579 | 85.135 |
| 04/11/2011 | 83.588 | 91.28 | 83.816 |
| 07/11/2011 | 83.064 | 90.353 | 83.306 |
| 08/11/2011 | 83.73 | 91.466 | 83.974 |
| 09/11/2011 | 82.036 | 89.796 | 82.271 |
| 10/11/2011 | 81.893 | 89.61 | 82.128 |
| 11/11/2011 | 83.993 | 91.651 | 84.233 |
| 14/11/2011 | 83.062 | 91.095 | 83.297 |
| 15/11/2011 | 82.187 | 90.353 | 82.42 |
| 16/11/2011 | 82.387 | 90.538 | 82.626 |
| 17/11/2011 | 81.417 | 89.61 | 81.652 |
| 18/11/2011 | 80.989 | 89.239 | 81.228 |
| 21/11/2011 | 78.434 | 86.642 | 78.665 |
| 22/11/2011 | 77.805 | 86.085 | 78.035 |
| 23/11/2011 | 76.668 | 84.972 | 76.894 |
| 24/11/2011 | 76.469 | 84.601 | 76.697 |
| 25/11/2011 | 76.906 | 84.972 | 77.134 |
| 28/11/2011 | 80.223 | 88.312 | 80.458 |
| 29/11/2011 | 80.73 | 88.868 | 80.966 |
| 30/11/2011 | 83.989 | 92.022 | 84.233 |
| 01/12/2011 | 83.441 | 91.651 | 83.683 |
| 02/12/2011 | 84.197 | 92.393 | 84.438 |
| 05/12/2011 | 85.036 | 92.95 | 85.277 |
| 06/12/2011 | 84.617 | 92.764 | 84.855 |
| 07/12/2011 | 84.358 | 92.764 | 84.593 |
| 08/12/2011 | 82.776 | 91.466 | 83.007 |
| 09/12/2011 | 84.128 | 92.95 | 84.364 |
| 12/12/2011 | 82.12 | 90.909 | 82.349 |
| 13/12/2011 | 82.124 | 90.909 | 82.351 |
| 14/12/2011 | 80.437 | 89.425 | 80.66 |
| 15/12/2011 | 81.325 | 90.538 | 81.548 |
| 16/12/2011 | 80.907 | 89.981 | 81.127 |
| 19/12/2011 | 81.053 | 90.167 | 81.272 |
| 20/12/2011 | 82.951 | 91.837 | 83.174 |
| 21/12/2011 | 82.445 | 91.28 | 82.666 |
| 22/12/2011 | 83.246 | 92.208 | 83.467 |
| 23/12/2011 | 83.931 | 92.95 | 84.155 |
| 26/12/2011 | 83.931 | 92.95 | 84.155 |
| 27/12/2011 | 83.963 | 92.95 | 84.155 |
| 28/12/2011 | 83.226 | 92.393 | 83.445 |
| 29/12/2011 | 84.117 | 93.321 | 84.353 |
| 30/12/2011 | 84.973 | 94.063 | 85.209 |
| 02/01/2012 | 86.362 | 94.063 | 85.209 |
| 03/01/2012 | 87.332 | 96.475 | 87.573 |
| 04/01/2012 | 86.414 | 95.733 | 86.66 |
| 05/01/2012 | 85.577 | 94.991 | 85.821 |
| 06/01/2012 | 85.342 | 94.805 | 85.583 |
| 09/01/2012 | 85.025 | 94.805 | 85.254 |
| 10/01/2012 | 86.745 | 96.289 | 86.986 |
| 11/01/2012 | 86.464 | 95.547 | 86.707 |
| 12/01/2012 | 86.695 | 95.547 | 86.932 |
| 13/01/2012 | 86.349 | 95.176 | 86.581 |
| 16/01/2012 | 87.114 | 96.104 | 87.352 |
| 17/01/2012 | 88.109 | 97.032 | 88.35 |
| 18/01/2012 | 88.263 | 97.403 | 88.508 |
| 19/01/2012 | 89.642 | 98.516 | 89.894 |
| 20/01/2012 | 89.257 | 98.145 | 89.51 |
| 23/01/2012 | 89.734 | 98.33 | 89.96 |
| 24/01/2012 | 89.329 | 98.33 | 89.58 |
| 25/01/2012 | 88.938 | 97.959 | 89.195 |
| 26/01/2012 | 90.214 | 99.072 | 90.473 |
| 27/01/2012 | 89.376 | 98.145 | 89.635 |
| 30/01/2012 | 88.298 | 97.217 | 88.553 |
| 31/01/2012 | 88.763 | 97.588 | 89.018 |
| 01/02/2012 | 90.688 | 99.072 | 90.946 |
| 02/02/2012 | 90.929 | 99.072 | 91.187 |
| 03/02/2012 | 92.287 | 100.742 | 92.546 |
| 06/02/2012 | 92.026 | 100.557 | 92.278 |
| 07/02/2012 | 92.07 | 100.742 | 92.322 |
| 08/02/2012 | 92.125 | 100.557 | 92.375 |
| 09/02/2012 | 92.415 | 100.928 | 92.665 |
| 10/02/2012 | 91.359 | 100 | 91.606 |
| 13/02/2012 | 91.918 | 100.557 | 92.164 |
| 14/02/2012 | 91.738 | 100.557 | 91.982 |
| 15/02/2012 | 92.315 | 101.113 | 92.56 |
| 16/02/2012 | 92.23 | 101.113 | 92.474 |
| 17/02/2012 | 93.14 | 101.67 | 93.388 |
| 20/02/2012 | 94.163 | 102.597 | 94.411 |
| 21/02/2012 | 93.75 | 102.226 | 93.997 |
| 22/02/2012 | 93.026 | 101.299 | 93.272 |
| 23/02/2012 | 92.779 | 101.299 | 93.025 |
| 24/02/2012 | 93.191 | 101.484 | 93.437 |
| 27/02/2012 | 92.792 | 100.928 | 93.036 |
| 28/02/2012 | 93.03 | 101.299 | 93.274 |
| 29/02/2012 | 92.9 | 100.928 | 93.14 |
| 01/03/2012 | 93.734 | 101.67 | 93.973 |
| 02/03/2012 | 93.82 | 101.855 | 94.066 |
| 05/03/2012 | 93.317 | 101.67 | 93.562 |
| 06/03/2012 | 90.457 | 99.072 | 90.695 |
| 07/03/2012 | 91.173 | 99.629 | 91.411 |
| 08/03/2012 | 93.053 | 101.67 | 93.3 |
| 09/03/2012 | 93.328 | 102.226 | 93.572 |
| 12/03/2012 | 93.265 | 102.226 | 93.505 |
| 13/03/2012 | 94.739 | 103.711 | 94.983 |
| 14/03/2012 | 95.083 | 103.896 | 95.33 |
| 15/03/2012 | 95.755 | 104.267 | 96.002 |
| 16/03/2012 | 96.128 | 104.453 | 96.383 |
| 19/03/2012 | 96.121 | 104.453 | 96.377 |
| 20/03/2012 | 95.082 | 103.34 | 95.334 |
| 21/03/2012 | 94.84 | 103.154 | 95.092 |
| 22/03/2012 | 93.683 | 102.041 | 93.935 |
| 23/03/2012 | 93.768 | 102.041 | 94.013 |
| 26/03/2012 | 94.665 | 103.34 | 94.912 |
| 27/03/2012 | 94.172 | 102.783 | 94.417 |
| 28/03/2012 | 93.401 | 102.226 | 93.645 |
| 29/03/2012 | 91.958 | 100.742 | 92.196 |
| 30/03/2012 | 93.072 | 101.855 | 93.318 |
| 02/04/2012 | 94.189 | 103.34 | 94.44 |
| 03/04/2012 | 93.158 | 102.597 | 93.403 |
| 04/04/2012 | 90.842 | 100 | 91.076 |
| 05/04/2012 | 90.833 | 100.186 | 91.078 |
| 06/04/2012 | 90.833 | 100.186 | 91.078 |
| 09/04/2012 | 90.783 | 100.186 | 91.078 |
| 10/04/2012 | 88.502 | 97.959 | 88.734 |
| 11/04/2012 | 89.124 | 98.145 | 89.359 |
| 12/04/2012 | 90.048 | 99.629 | 90.29 |
| 13/04/2012 | 88.369 | 98.145 | 88.621 |
| 16/04/2012 | 88.824 | 99.072 | 89.081 |
| 17/04/2012 | 90.787 | 100.557 | 91.061 |
| 18/04/2012 | 89.646 | 99.814 | 89.913 |
| 19/04/2012 | 88.969 | 99.814 | 89.232 |